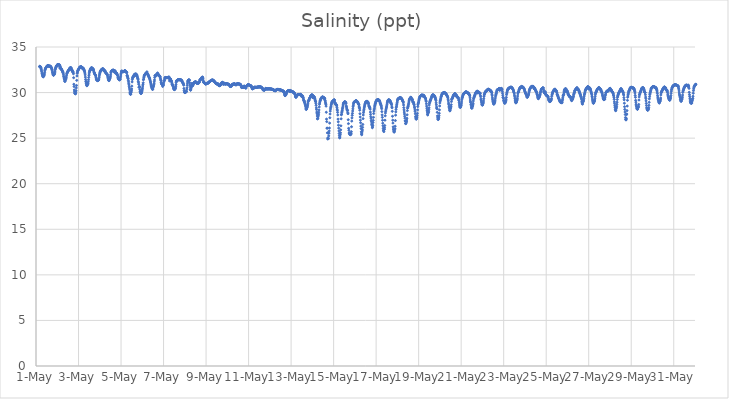
| Category | Salinity (ppt) |
|---|---|
| 44682.166666666664 | 32.84 |
| 44682.177083333336 | 32.89 |
| 44682.1875 | 32.84 |
| 44682.197916666664 | 32.81 |
| 44682.208333333336 | 32.85 |
| 44682.21875 | 32.77 |
| 44682.229166666664 | 32.74 |
| 44682.239583333336 | 32.63 |
| 44682.25 | 32.54 |
| 44682.260416666664 | 32.39 |
| 44682.270833333336 | 32.27 |
| 44682.28125 | 32.12 |
| 44682.291666666664 | 32.03 |
| 44682.302083333336 | 31.93 |
| 44682.3125 | 31.86 |
| 44682.322916666664 | 31.76 |
| 44682.333333333336 | 31.73 |
| 44682.34375 | 31.73 |
| 44682.354166666664 | 31.83 |
| 44682.364583333336 | 31.8 |
| 44682.375 | 31.86 |
| 44682.385416666664 | 31.94 |
| 44682.395833333336 | 32.05 |
| 44682.40625 | 32.22 |
| 44682.416666666664 | 32.4 |
| 44682.427083333336 | 32.54 |
| 44682.4375 | 32.59 |
| 44682.447916666664 | 32.65 |
| 44682.458333333336 | 32.69 |
| 44682.46875 | 32.74 |
| 44682.479166666664 | 32.77 |
| 44682.489583333336 | 32.81 |
| 44682.5 | 32.84 |
| 44682.510416666664 | 32.87 |
| 44682.520833333336 | 32.89 |
| 44682.53125 | 32.94 |
| 44682.541666666664 | 32.95 |
| 44682.552083333336 | 32.95 |
| 44682.5625 | 32.96 |
| 44682.572916666664 | 32.96 |
| 44682.583333333336 | 32.96 |
| 44682.59375 | 32.94 |
| 44682.604166666664 | 32.87 |
| 44682.614583333336 | 32.9 |
| 44682.625 | 32.87 |
| 44682.635416666664 | 32.93 |
| 44682.645833333336 | 32.9 |
| 44682.65625 | 32.85 |
| 44682.666666666664 | 32.88 |
| 44682.677083333336 | 32.89 |
| 44682.6875 | 32.87 |
| 44682.697916666664 | 32.81 |
| 44682.708333333336 | 32.8 |
| 44682.71875 | 32.75 |
| 44682.729166666664 | 32.67 |
| 44682.739583333336 | 32.6 |
| 44682.75 | 32.54 |
| 44682.760416666664 | 32.45 |
| 44682.770833333336 | 32.28 |
| 44682.78125 | 32.18 |
| 44682.791666666664 | 32.06 |
| 44682.802083333336 | 31.96 |
| 44682.8125 | 31.93 |
| 44682.822916666664 | 31.91 |
| 44682.833333333336 | 31.91 |
| 44682.84375 | 31.98 |
| 44682.854166666664 | 32.02 |
| 44682.864583333336 | 32.03 |
| 44682.875 | 32.08 |
| 44682.885416666664 | 32.23 |
| 44682.895833333336 | 32.36 |
| 44682.90625 | 32.54 |
| 44682.916666666664 | 32.63 |
| 44682.927083333336 | 32.72 |
| 44682.9375 | 32.78 |
| 44682.947916666664 | 32.83 |
| 44682.958333333336 | 32.88 |
| 44682.96875 | 32.92 |
| 44682.979166666664 | 32.93 |
| 44682.989583333336 | 32.98 |
| 44683.0 | 33.03 |
| 44683.010416666664 | 33.07 |
| 44683.020833333336 | 33.07 |
| 44683.03125 | 33.07 |
| 44683.041666666664 | 33.07 |
| 44683.052083333336 | 33.06 |
| 44683.0625 | 33.06 |
| 44683.072916666664 | 33 |
| 44683.083333333336 | 33.03 |
| 44683.09375 | 33.04 |
| 44683.104166666664 | 33.05 |
| 44683.114583333336 | 32.7 |
| 44683.125 | 32.89 |
| 44683.135416666664 | 32.91 |
| 44683.145833333336 | 32.79 |
| 44683.15625 | 32.66 |
| 44683.166666666664 | 32.62 |
| 44683.177083333336 | 32.58 |
| 44683.1875 | 32.64 |
| 44683.197916666664 | 32.55 |
| 44683.208333333336 | 32.52 |
| 44683.21875 | 32.46 |
| 44683.229166666664 | 32.43 |
| 44683.239583333336 | 32.37 |
| 44683.25 | 32.27 |
| 44683.260416666664 | 32.27 |
| 44683.270833333336 | 32.23 |
| 44683.28125 | 32.12 |
| 44683.291666666664 | 31.95 |
| 44683.302083333336 | 31.78 |
| 44683.3125 | 31.7 |
| 44683.322916666664 | 31.58 |
| 44683.333333333336 | 31.48 |
| 44683.34375 | 31.39 |
| 44683.354166666664 | 31.24 |
| 44683.364583333336 | 31.22 |
| 44683.375 | 31.36 |
| 44683.385416666664 | 31.42 |
| 44683.395833333336 | 31.44 |
| 44683.40625 | 31.51 |
| 44683.416666666664 | 31.6 |
| 44683.427083333336 | 31.71 |
| 44683.4375 | 31.9 |
| 44683.447916666664 | 32.06 |
| 44683.458333333336 | 32.14 |
| 44683.46875 | 32.16 |
| 44683.479166666664 | 32.23 |
| 44683.489583333336 | 32.3 |
| 44683.5 | 32.34 |
| 44683.510416666664 | 32.36 |
| 44683.520833333336 | 32.4 |
| 44683.53125 | 32.44 |
| 44683.541666666664 | 32.48 |
| 44683.552083333336 | 32.51 |
| 44683.5625 | 32.56 |
| 44683.572916666664 | 32.61 |
| 44683.583333333336 | 32.65 |
| 44683.59375 | 32.68 |
| 44683.604166666664 | 32.7 |
| 44683.614583333336 | 32.71 |
| 44683.625 | 32.75 |
| 44683.635416666664 | 32.7 |
| 44683.645833333336 | 32.72 |
| 44683.65625 | 32.68 |
| 44683.666666666664 | 32.59 |
| 44683.677083333336 | 32.42 |
| 44683.6875 | 32.48 |
| 44683.697916666664 | 32.44 |
| 44683.708333333336 | 32.43 |
| 44683.71875 | 32.3 |
| 44683.729166666664 | 32.26 |
| 44683.739583333336 | 32.28 |
| 44683.75 | 32.23 |
| 44683.760416666664 | 32.06 |
| 44683.770833333336 | 31.63 |
| 44683.78125 | 30.91 |
| 44683.791666666664 | 30.66 |
| 44683.802083333336 | 30.29 |
| 44683.8125 | 30.1 |
| 44683.822916666664 | 29.96 |
| 44683.833333333336 | 29.9 |
| 44683.84375 | 29.87 |
| 44683.854166666664 | 29.88 |
| 44683.864583333336 | 29.88 |
| 44683.875 | 30.06 |
| 44683.885416666664 | 30.21 |
| 44683.895833333336 | 30.51 |
| 44683.90625 | 30.78 |
| 44683.916666666664 | 31.34 |
| 44683.927083333336 | 31.82 |
| 44683.9375 | 32.11 |
| 44683.947916666664 | 32.22 |
| 44683.958333333336 | 32.34 |
| 44683.96875 | 32.42 |
| 44683.979166666664 | 32.44 |
| 44683.989583333336 | 32.5 |
| 44684.0 | 32.55 |
| 44684.010416666664 | 32.58 |
| 44684.020833333336 | 32.62 |
| 44684.03125 | 32.68 |
| 44684.041666666664 | 32.73 |
| 44684.052083333336 | 32.77 |
| 44684.0625 | 32.79 |
| 44684.072916666664 | 32.8 |
| 44684.083333333336 | 32.81 |
| 44684.09375 | 32.81 |
| 44684.104166666664 | 32.81 |
| 44684.114583333336 | 32.82 |
| 44684.125 | 32.83 |
| 44684.135416666664 | 32.83 |
| 44684.145833333336 | 32.8 |
| 44684.15625 | 32.69 |
| 44684.166666666664 | 32.71 |
| 44684.177083333336 | 32.69 |
| 44684.1875 | 32.67 |
| 44684.197916666664 | 32.67 |
| 44684.208333333336 | 32.72 |
| 44684.21875 | 32.66 |
| 44684.229166666664 | 32.63 |
| 44684.239583333336 | 32.61 |
| 44684.25 | 32.51 |
| 44684.260416666664 | 32.47 |
| 44684.270833333336 | 32.44 |
| 44684.28125 | 32.35 |
| 44684.291666666664 | 32.25 |
| 44684.302083333336 | 32.13 |
| 44684.3125 | 31.94 |
| 44684.322916666664 | 31.7 |
| 44684.333333333336 | 31.45 |
| 44684.34375 | 31.25 |
| 44684.354166666664 | 31.16 |
| 44684.364583333336 | 31 |
| 44684.375 | 30.88 |
| 44684.385416666664 | 30.79 |
| 44684.395833333336 | 30.74 |
| 44684.40625 | 30.8 |
| 44684.416666666664 | 30.91 |
| 44684.427083333336 | 30.9 |
| 44684.4375 | 30.93 |
| 44684.447916666664 | 31.02 |
| 44684.458333333336 | 31.18 |
| 44684.46875 | 31.4 |
| 44684.479166666664 | 31.65 |
| 44684.489583333336 | 31.87 |
| 44684.5 | 32.04 |
| 44684.510416666664 | 32.21 |
| 44684.520833333336 | 32.32 |
| 44684.53125 | 32.39 |
| 44684.541666666664 | 32.45 |
| 44684.552083333336 | 32.5 |
| 44684.5625 | 32.57 |
| 44684.572916666664 | 32.62 |
| 44684.583333333336 | 32.66 |
| 44684.59375 | 32.69 |
| 44684.604166666664 | 32.71 |
| 44684.614583333336 | 32.74 |
| 44684.625 | 32.6 |
| 44684.635416666664 | 32.53 |
| 44684.645833333336 | 32.69 |
| 44684.65625 | 32.65 |
| 44684.666666666664 | 32.61 |
| 44684.677083333336 | 32.58 |
| 44684.6875 | 32.6 |
| 44684.697916666664 | 32.53 |
| 44684.708333333336 | 32.48 |
| 44684.71875 | 32.35 |
| 44684.729166666664 | 32.23 |
| 44684.739583333336 | 32.15 |
| 44684.75 | 32.16 |
| 44684.760416666664 | 32.05 |
| 44684.770833333336 | 32 |
| 44684.78125 | 31.96 |
| 44684.791666666664 | 31.92 |
| 44684.802083333336 | 31.89 |
| 44684.8125 | 31.81 |
| 44684.822916666664 | 31.65 |
| 44684.833333333336 | 31.5 |
| 44684.84375 | 31.44 |
| 44684.854166666664 | 31.4 |
| 44684.864583333336 | 31.38 |
| 44684.875 | 31.36 |
| 44684.885416666664 | 31.33 |
| 44684.895833333336 | 31.31 |
| 44684.90625 | 31.32 |
| 44684.916666666664 | 31.39 |
| 44684.927083333336 | 31.37 |
| 44684.9375 | 31.36 |
| 44684.947916666664 | 31.39 |
| 44684.958333333336 | 31.49 |
| 44684.96875 | 31.65 |
| 44684.979166666664 | 31.83 |
| 44684.989583333336 | 31.99 |
| 44685.0 | 32.12 |
| 44685.010416666664 | 32.21 |
| 44685.020833333336 | 32.28 |
| 44685.03125 | 32.34 |
| 44685.041666666664 | 32.39 |
| 44685.052083333336 | 32.43 |
| 44685.0625 | 32.46 |
| 44685.072916666664 | 32.5 |
| 44685.083333333336 | 32.52 |
| 44685.09375 | 32.53 |
| 44685.104166666664 | 32.56 |
| 44685.114583333336 | 32.59 |
| 44685.125 | 32.6 |
| 44685.135416666664 | 32.62 |
| 44685.145833333336 | 32.59 |
| 44685.15625 | 32.59 |
| 44685.166666666664 | 32.58 |
| 44685.177083333336 | 32.42 |
| 44685.1875 | 32.49 |
| 44685.197916666664 | 32.46 |
| 44685.208333333336 | 32.46 |
| 44685.21875 | 32.36 |
| 44685.229166666664 | 32.39 |
| 44685.239583333336 | 32.4 |
| 44685.25 | 32.36 |
| 44685.260416666664 | 32.22 |
| 44685.270833333336 | 32.25 |
| 44685.28125 | 32.17 |
| 44685.291666666664 | 32.15 |
| 44685.302083333336 | 32.12 |
| 44685.3125 | 32.09 |
| 44685.322916666664 | 32.06 |
| 44685.333333333336 | 32.04 |
| 44685.34375 | 32.02 |
| 44685.354166666664 | 31.98 |
| 44685.364583333336 | 31.89 |
| 44685.375 | 31.74 |
| 44685.385416666664 | 31.63 |
| 44685.395833333336 | 31.53 |
| 44685.40625 | 31.43 |
| 44685.416666666664 | 31.37 |
| 44685.427083333336 | 31.31 |
| 44685.4375 | 31.31 |
| 44685.447916666664 | 31.43 |
| 44685.458333333336 | 31.46 |
| 44685.46875 | 31.5 |
| 44685.479166666664 | 31.56 |
| 44685.489583333336 | 31.66 |
| 44685.5 | 31.78 |
| 44685.510416666664 | 31.95 |
| 44685.520833333336 | 32.17 |
| 44685.53125 | 32.27 |
| 44685.541666666664 | 32.31 |
| 44685.552083333336 | 32.33 |
| 44685.5625 | 32.37 |
| 44685.572916666664 | 32.42 |
| 44685.583333333336 | 32.42 |
| 44685.59375 | 32.44 |
| 44685.604166666664 | 32.44 |
| 44685.614583333336 | 32.44 |
| 44685.625 | 32.46 |
| 44685.635416666664 | 32.45 |
| 44685.645833333336 | 32.46 |
| 44685.65625 | 32.42 |
| 44685.666666666664 | 32.32 |
| 44685.677083333336 | 32.26 |
| 44685.6875 | 32.29 |
| 44685.697916666664 | 32.41 |
| 44685.708333333336 | 32.37 |
| 44685.71875 | 32.35 |
| 44685.729166666664 | 32.35 |
| 44685.739583333336 | 32.13 |
| 44685.75 | 32.2 |
| 44685.760416666664 | 32.14 |
| 44685.770833333336 | 32.14 |
| 44685.78125 | 32.16 |
| 44685.791666666664 | 32.09 |
| 44685.802083333336 | 32.11 |
| 44685.8125 | 32.01 |
| 44685.822916666664 | 31.95 |
| 44685.833333333336 | 31.88 |
| 44685.84375 | 31.85 |
| 44685.854166666664 | 31.61 |
| 44685.864583333336 | 31.68 |
| 44685.875 | 31.52 |
| 44685.885416666664 | 31.53 |
| 44685.895833333336 | 31.45 |
| 44685.90625 | 31.46 |
| 44685.916666666664 | 31.43 |
| 44685.927083333336 | 31.37 |
| 44685.9375 | 31.45 |
| 44685.947916666664 | 31.42 |
| 44685.958333333336 | 31.47 |
| 44685.96875 | 31.6 |
| 44685.979166666664 | 31.75 |
| 44685.989583333336 | 31.93 |
| 44686.0 | 32.09 |
| 44686.010416666664 | 32.25 |
| 44686.020833333336 | 32.33 |
| 44686.03125 | 32.35 |
| 44686.041666666664 | 32.35 |
| 44686.052083333336 | 32.35 |
| 44686.0625 | 32.3 |
| 44686.072916666664 | 32.3 |
| 44686.083333333336 | 32.29 |
| 44686.09375 | 32.28 |
| 44686.104166666664 | 32.29 |
| 44686.114583333336 | 32.31 |
| 44686.125 | 32.31 |
| 44686.135416666664 | 32.31 |
| 44686.145833333336 | 32.33 |
| 44686.15625 | 32.37 |
| 44686.166666666664 | 32.39 |
| 44686.177083333336 | 32.4 |
| 44686.1875 | 32.39 |
| 44686.197916666664 | 32.37 |
| 44686.208333333336 | 32.37 |
| 44686.21875 | 32.26 |
| 44686.229166666664 | 32.3 |
| 44686.239583333336 | 32.29 |
| 44686.25 | 32.27 |
| 44686.260416666664 | 32.21 |
| 44686.270833333336 | 32.17 |
| 44686.28125 | 31.84 |
| 44686.291666666664 | 31.9 |
| 44686.302083333336 | 31.78 |
| 44686.3125 | 31.68 |
| 44686.322916666664 | 31.58 |
| 44686.333333333336 | 31.52 |
| 44686.34375 | 31.34 |
| 44686.354166666664 | 31.17 |
| 44686.364583333336 | 30.97 |
| 44686.375 | 30.84 |
| 44686.385416666664 | 30.65 |
| 44686.395833333336 | 30.5 |
| 44686.40625 | 30.3 |
| 44686.416666666664 | 30.05 |
| 44686.427083333336 | 29.92 |
| 44686.4375 | 29.82 |
| 44686.447916666664 | 29.82 |
| 44686.458333333336 | 29.82 |
| 44686.46875 | 29.99 |
| 44686.479166666664 | 30.08 |
| 44686.489583333336 | 30.22 |
| 44686.5 | 30.4 |
| 44686.510416666664 | 30.71 |
| 44686.520833333336 | 31.17 |
| 44686.53125 | 31.43 |
| 44686.541666666664 | 31.58 |
| 44686.552083333336 | 31.68 |
| 44686.5625 | 31.71 |
| 44686.572916666664 | 31.7 |
| 44686.583333333336 | 31.75 |
| 44686.59375 | 31.81 |
| 44686.604166666664 | 31.87 |
| 44686.614583333336 | 31.93 |
| 44686.625 | 31.93 |
| 44686.635416666664 | 32 |
| 44686.645833333336 | 32 |
| 44686.65625 | 32 |
| 44686.666666666664 | 31.89 |
| 44686.677083333336 | 31.89 |
| 44686.6875 | 32.07 |
| 44686.697916666664 | 31.98 |
| 44686.708333333336 | 31.94 |
| 44686.71875 | 32.01 |
| 44686.739583333336 | 31.95 |
| 44686.75 | 31.87 |
| 44686.760416666664 | 31.79 |
| 44686.770833333336 | 31.69 |
| 44686.78125 | 31.58 |
| 44686.791666666664 | 31.52 |
| 44686.802083333336 | 31.44 |
| 44686.8125 | 31.23 |
| 44686.822916666664 | 31.09 |
| 44686.833333333336 | 30.91 |
| 44686.84375 | 30.59 |
| 44686.854166666664 | 30.58 |
| 44686.864583333336 | 30.68 |
| 44686.875 | 30.62 |
| 44686.885416666664 | 30.34 |
| 44686.895833333336 | 30.14 |
| 44686.90625 | 30.05 |
| 44686.916666666664 | 30.03 |
| 44686.927083333336 | 29.92 |
| 44686.9375 | 29.88 |
| 44686.947916666664 | 29.93 |
| 44686.958333333336 | 29.95 |
| 44686.96875 | 30.04 |
| 44686.979166666664 | 30.11 |
| 44686.989583333336 | 30.22 |
| 44687.0 | 30.37 |
| 44687.010416666664 | 30.5 |
| 44687.020833333336 | 30.72 |
| 44687.03125 | 30.9 |
| 44687.041666666664 | 31.07 |
| 44687.052083333336 | 31.4 |
| 44687.0625 | 31.48 |
| 44687.072916666664 | 31.64 |
| 44687.083333333336 | 31.75 |
| 44687.09375 | 31.86 |
| 44687.104166666664 | 31.92 |
| 44687.114583333336 | 31.94 |
| 44687.125 | 31.98 |
| 44687.135416666664 | 32.01 |
| 44687.145833333336 | 32.06 |
| 44687.15625 | 32.09 |
| 44687.166666666664 | 32.11 |
| 44687.177083333336 | 32.12 |
| 44687.1875 | 32.15 |
| 44687.197916666664 | 32.16 |
| 44687.208333333336 | 32.17 |
| 44687.21875 | 32.28 |
| 44687.229166666664 | 32.09 |
| 44687.239583333336 | 32.07 |
| 44687.25 | 32.08 |
| 44687.260416666664 | 32 |
| 44687.270833333336 | 31.89 |
| 44687.28125 | 31.93 |
| 44687.291666666664 | 31.83 |
| 44687.302083333336 | 31.8 |
| 44687.3125 | 31.72 |
| 44687.322916666664 | 31.65 |
| 44687.333333333336 | 31.63 |
| 44687.34375 | 31.54 |
| 44687.354166666664 | 31.47 |
| 44687.364583333336 | 31.37 |
| 44687.375 | 31.27 |
| 44687.385416666664 | 31.16 |
| 44687.395833333336 | 31.05 |
| 44687.40625 | 30.92 |
| 44687.416666666664 | 30.81 |
| 44687.427083333336 | 30.69 |
| 44687.4375 | 30.63 |
| 44687.447916666664 | 30.52 |
| 44687.458333333336 | 30.5 |
| 44687.46875 | 30.45 |
| 44687.479166666664 | 30.34 |
| 44687.489583333336 | 30.38 |
| 44687.5 | 30.39 |
| 44687.510416666664 | 30.57 |
| 44687.520833333336 | 30.69 |
| 44687.53125 | 30.74 |
| 44687.541666666664 | 30.86 |
| 44687.552083333336 | 30.98 |
| 44687.5625 | 31.18 |
| 44687.572916666664 | 31.38 |
| 44687.583333333336 | 31.65 |
| 44687.59375 | 31.83 |
| 44687.604166666664 | 31.88 |
| 44687.614583333336 | 31.86 |
| 44687.625 | 31.83 |
| 44687.635416666664 | 31.88 |
| 44687.645833333336 | 31.92 |
| 44687.65625 | 31.95 |
| 44687.666666666664 | 31.98 |
| 44687.677083333336 | 31.99 |
| 44687.6875 | 31.98 |
| 44687.697916666664 | 32 |
| 44687.708333333336 | 32.09 |
| 44687.71875 | 32.16 |
| 44687.729166666664 | 31.92 |
| 44687.739583333336 | 32.02 |
| 44687.75 | 31.95 |
| 44687.760416666664 | 32 |
| 44687.770833333336 | 31.91 |
| 44687.78125 | 31.91 |
| 44687.791666666664 | 31.87 |
| 44687.802083333336 | 31.83 |
| 44687.8125 | 31.81 |
| 44687.822916666664 | 31.78 |
| 44687.833333333336 | 31.77 |
| 44687.84375 | 31.68 |
| 44687.854166666664 | 31.53 |
| 44687.864583333336 | 31.38 |
| 44687.875 | 31.37 |
| 44687.885416666664 | 31.14 |
| 44687.895833333336 | 31.07 |
| 44687.90625 | 30.97 |
| 44687.916666666664 | 30.93 |
| 44687.927083333336 | 30.91 |
| 44687.9375 | 30.88 |
| 44687.947916666664 | 30.86 |
| 44687.958333333336 | 30.67 |
| 44687.96875 | 30.81 |
| 44687.979166666664 | 30.82 |
| 44687.989583333336 | 30.81 |
| 44688.0 | 30.95 |
| 44688.010416666664 | 31.15 |
| 44688.020833333336 | 31.3 |
| 44688.03125 | 31.28 |
| 44688.041666666664 | 31.33 |
| 44688.052083333336 | 31.49 |
| 44688.0625 | 31.59 |
| 44688.072916666664 | 31.64 |
| 44688.083333333336 | 31.66 |
| 44688.09375 | 31.65 |
| 44688.104166666664 | 31.65 |
| 44688.114583333336 | 31.64 |
| 44688.125 | 31.64 |
| 44688.135416666664 | 31.64 |
| 44688.145833333336 | 31.64 |
| 44688.15625 | 31.63 |
| 44688.166666666664 | 31.63 |
| 44688.177083333336 | 31.64 |
| 44688.1875 | 31.65 |
| 44688.197916666664 | 31.66 |
| 44688.208333333336 | 31.67 |
| 44688.21875 | 31.66 |
| 44688.229166666664 | 31.66 |
| 44688.239583333336 | 31.68 |
| 44688.25 | 31.69 |
| 44688.260416666664 | 31.71 |
| 44688.270833333336 | 31.53 |
| 44688.28125 | 31.28 |
| 44688.291666666664 | 31.52 |
| 44688.302083333336 | 31.49 |
| 44688.3125 | 31.46 |
| 44688.322916666664 | 31.52 |
| 44688.333333333336 | 31.46 |
| 44688.34375 | 31.37 |
| 44688.354166666664 | 31.32 |
| 44688.364583333336 | 31.26 |
| 44688.375 | 31.26 |
| 44688.385416666664 | 31.13 |
| 44688.395833333336 | 30.96 |
| 44688.40625 | 30.91 |
| 44688.416666666664 | 30.88 |
| 44688.427083333336 | 30.82 |
| 44688.4375 | 30.75 |
| 44688.447916666664 | 30.7 |
| 44688.458333333336 | 30.62 |
| 44688.46875 | 30.49 |
| 44688.479166666664 | 30.41 |
| 44688.489583333336 | 30.4 |
| 44688.5 | 30.34 |
| 44688.510416666664 | 30.33 |
| 44688.520833333336 | 30.33 |
| 44688.53125 | 30.4 |
| 44688.541666666664 | 30.4 |
| 44688.552083333336 | 30.43 |
| 44688.5625 | 30.52 |
| 44688.572916666664 | 30.69 |
| 44688.583333333336 | 30.87 |
| 44688.59375 | 31.1 |
| 44688.604166666664 | 31.23 |
| 44688.614583333336 | 31.29 |
| 44688.625 | 31.31 |
| 44688.635416666664 | 31.34 |
| 44688.645833333336 | 31.34 |
| 44688.65625 | 31.36 |
| 44688.666666666664 | 31.39 |
| 44688.677083333336 | 31.41 |
| 44688.6875 | 31.41 |
| 44688.697916666664 | 31.41 |
| 44688.708333333336 | 31.4 |
| 44688.71875 | 31.41 |
| 44688.729166666664 | 31.42 |
| 44688.739583333336 | 31.42 |
| 44688.75 | 31.42 |
| 44688.760416666664 | 31.4 |
| 44688.770833333336 | 31.39 |
| 44688.78125 | 31.4 |
| 44688.791666666664 | 31.41 |
| 44688.802083333336 | 31.42 |
| 44688.8125 | 31.41 |
| 44688.822916666664 | 31.36 |
| 44688.833333333336 | 31.36 |
| 44688.84375 | 31.34 |
| 44688.854166666664 | 31.33 |
| 44688.864583333336 | 31.27 |
| 44688.875 | 31.25 |
| 44688.885416666664 | 31.13 |
| 44688.895833333336 | 31.1 |
| 44688.90625 | 31.07 |
| 44688.916666666664 | 31.05 |
| 44688.927083333336 | 30.96 |
| 44688.9375 | 30.92 |
| 44688.947916666664 | 30.81 |
| 44688.958333333336 | 30.45 |
| 44688.96875 | 30.22 |
| 44688.979166666664 | 30.07 |
| 44688.989583333336 | 30.02 |
| 44689.0 | 30 |
| 44689.010416666664 | 30.01 |
| 44689.020833333336 | 30.01 |
| 44689.03125 | 30.05 |
| 44689.041666666664 | 30.06 |
| 44689.052083333336 | 30.07 |
| 44689.0625 | 30.09 |
| 44689.072916666664 | 30.11 |
| 44689.083333333336 | 30.14 |
| 44689.09375 | 30.36 |
| 44689.104166666664 | 30.53 |
| 44689.114583333336 | 30.8 |
| 44689.125 | 31.03 |
| 44689.135416666664 | 31.19 |
| 44689.145833333336 | 31.28 |
| 44689.15625 | 31.33 |
| 44689.166666666664 | 31.36 |
| 44689.177083333336 | 31.38 |
| 44689.1875 | 31.38 |
| 44689.197916666664 | 31.38 |
| 44689.208333333336 | 31.39 |
| 44689.21875 | 31.35 |
| 44689.229166666664 | 31.09 |
| 44689.239583333336 | 30.86 |
| 44689.25 | 30.66 |
| 44689.260416666664 | 30.37 |
| 44689.270833333336 | 30.25 |
| 44689.28125 | 30.31 |
| 44689.291666666664 | 30.49 |
| 44689.302083333336 | 30.54 |
| 44689.3125 | 30.68 |
| 44689.322916666664 | 30.78 |
| 44689.333333333336 | 31.01 |
| 44689.34375 | 30.82 |
| 44689.354166666664 | 30.84 |
| 44689.364583333336 | 30.75 |
| 44689.375 | 30.76 |
| 44689.385416666664 | 30.91 |
| 44689.395833333336 | 30.87 |
| 44689.40625 | 30.99 |
| 44689.416666666664 | 31.04 |
| 44689.427083333336 | 31.07 |
| 44689.4375 | 31.1 |
| 44689.447916666664 | 31.12 |
| 44689.458333333336 | 31.09 |
| 44689.46875 | 31.13 |
| 44689.479166666664 | 31.17 |
| 44689.489583333336 | 31.16 |
| 44689.5 | 31.2 |
| 44689.510416666664 | 31.21 |
| 44689.520833333336 | 31.14 |
| 44689.53125 | 31.12 |
| 44689.541666666664 | 31.07 |
| 44689.552083333336 | 31.07 |
| 44689.5625 | 31.03 |
| 44689.572916666664 | 31.03 |
| 44689.583333333336 | 31.04 |
| 44689.59375 | 31.03 |
| 44689.604166666664 | 31.05 |
| 44689.614583333336 | 31.04 |
| 44689.625 | 31.04 |
| 44689.635416666664 | 31.03 |
| 44689.645833333336 | 31.03 |
| 44689.65625 | 31.05 |
| 44689.666666666664 | 31.11 |
| 44689.677083333336 | 31.15 |
| 44689.6875 | 31.16 |
| 44689.697916666664 | 31.29 |
| 44689.708333333336 | 31.38 |
| 44689.71875 | 31.44 |
| 44689.729166666664 | 31.43 |
| 44689.739583333336 | 31.42 |
| 44689.75 | 31.44 |
| 44689.760416666664 | 31.46 |
| 44689.770833333336 | 31.52 |
| 44689.78125 | 31.59 |
| 44689.791666666664 | 31.62 |
| 44689.802083333336 | 31.65 |
| 44689.8125 | 31.68 |
| 44689.822916666664 | 31.66 |
| 44689.833333333336 | 31.71 |
| 44689.84375 | 31.66 |
| 44689.854166666664 | 31.54 |
| 44689.864583333336 | 31.36 |
| 44689.875 | 31.21 |
| 44689.885416666664 | 31.13 |
| 44689.895833333336 | 31.1 |
| 44689.90625 | 31.09 |
| 44689.916666666664 | 31.1 |
| 44689.927083333336 | 31.07 |
| 44689.9375 | 31.06 |
| 44689.947916666664 | 31 |
| 44689.958333333336 | 30.98 |
| 44689.96875 | 30.96 |
| 44689.979166666664 | 30.93 |
| 44689.989583333336 | 30.93 |
| 44690.0 | 30.97 |
| 44690.010416666664 | 30.97 |
| 44690.020833333336 | 31 |
| 44690.03125 | 30.99 |
| 44690.041666666664 | 31 |
| 44690.052083333336 | 31.02 |
| 44690.0625 | 31.03 |
| 44690.072916666664 | 31.03 |
| 44690.083333333336 | 31.04 |
| 44690.09375 | 31.04 |
| 44690.104166666664 | 31.05 |
| 44690.114583333336 | 31.07 |
| 44690.125 | 31.12 |
| 44690.135416666664 | 31.14 |
| 44690.145833333336 | 31.16 |
| 44690.15625 | 31.19 |
| 44690.166666666664 | 31.22 |
| 44690.177083333336 | 31.22 |
| 44690.1875 | 31.23 |
| 44690.197916666664 | 31.27 |
| 44690.208333333336 | 31.29 |
| 44690.21875 | 31.3 |
| 44690.229166666664 | 31.3 |
| 44690.239583333336 | 31.32 |
| 44690.25 | 31.34 |
| 44690.260416666664 | 31.35 |
| 44690.270833333336 | 31.36 |
| 44690.28125 | 31.37 |
| 44690.291666666664 | 31.37 |
| 44690.302083333336 | 31.37 |
| 44690.3125 | 31.37 |
| 44690.322916666664 | 31.37 |
| 44690.333333333336 | 31.28 |
| 44690.34375 | 31.35 |
| 44690.354166666664 | 31.32 |
| 44690.364583333336 | 31.3 |
| 44690.375 | 31.25 |
| 44690.385416666664 | 31.23 |
| 44690.395833333336 | 31.18 |
| 44690.40625 | 31.17 |
| 44690.416666666664 | 31.17 |
| 44690.427083333336 | 31.14 |
| 44690.4375 | 31.1 |
| 44690.447916666664 | 31.05 |
| 44690.458333333336 | 31.01 |
| 44690.46875 | 30.98 |
| 44690.479166666664 | 30.96 |
| 44690.489583333336 | 30.97 |
| 44690.5 | 30.95 |
| 44690.510416666664 | 30.97 |
| 44690.520833333336 | 30.96 |
| 44690.53125 | 30.94 |
| 44690.541666666664 | 30.95 |
| 44690.552083333336 | 30.95 |
| 44690.5625 | 30.94 |
| 44690.572916666664 | 30.94 |
| 44690.583333333336 | 30.9 |
| 44690.59375 | 30.79 |
| 44690.604166666664 | 30.76 |
| 44690.614583333336 | 30.76 |
| 44690.625 | 30.76 |
| 44690.635416666664 | 30.76 |
| 44690.645833333336 | 30.78 |
| 44690.65625 | 30.8 |
| 44690.666666666664 | 30.8 |
| 44690.677083333336 | 30.8 |
| 44690.6875 | 30.86 |
| 44690.697916666664 | 30.96 |
| 44690.708333333336 | 31.03 |
| 44690.71875 | 31.04 |
| 44690.729166666664 | 31.05 |
| 44690.739583333336 | 31.05 |
| 44690.75 | 31.06 |
| 44690.760416666664 | 31.1 |
| 44690.770833333336 | 31.11 |
| 44690.78125 | 31.13 |
| 44690.791666666664 | 30.96 |
| 44690.802083333336 | 31.05 |
| 44690.8125 | 30.91 |
| 44690.822916666664 | 30.93 |
| 44690.833333333336 | 30.97 |
| 44690.84375 | 30.96 |
| 44690.854166666664 | 30.96 |
| 44690.864583333336 | 31.03 |
| 44690.875 | 30.98 |
| 44690.885416666664 | 30.96 |
| 44690.895833333336 | 30.94 |
| 44690.90625 | 30.92 |
| 44690.916666666664 | 30.93 |
| 44690.927083333336 | 30.95 |
| 44690.9375 | 30.96 |
| 44690.947916666664 | 30.98 |
| 44690.958333333336 | 30.96 |
| 44690.96875 | 30.97 |
| 44690.979166666664 | 30.97 |
| 44690.989583333336 | 30.96 |
| 44691.0 | 30.94 |
| 44691.010416666664 | 30.94 |
| 44691.020833333336 | 30.92 |
| 44691.03125 | 30.93 |
| 44691.041666666664 | 30.92 |
| 44691.052083333336 | 30.93 |
| 44691.0625 | 30.89 |
| 44691.072916666664 | 30.86 |
| 44691.083333333336 | 30.89 |
| 44691.09375 | 30.83 |
| 44691.104166666664 | 30.76 |
| 44691.114583333336 | 30.81 |
| 44691.125 | 30.72 |
| 44691.135416666664 | 30.65 |
| 44691.145833333336 | 30.67 |
| 44691.15625 | 30.68 |
| 44691.166666666664 | 30.7 |
| 44691.177083333336 | 30.69 |
| 44691.1875 | 30.7 |
| 44691.197916666664 | 30.71 |
| 44691.208333333336 | 30.82 |
| 44691.21875 | 30.89 |
| 44691.229166666664 | 30.87 |
| 44691.239583333336 | 30.89 |
| 44691.25 | 30.9 |
| 44691.260416666664 | 30.93 |
| 44691.270833333336 | 30.93 |
| 44691.28125 | 30.92 |
| 44691.291666666664 | 30.92 |
| 44691.302083333336 | 30.93 |
| 44691.3125 | 30.95 |
| 44691.322916666664 | 30.96 |
| 44691.333333333336 | 30.97 |
| 44691.34375 | 30.91 |
| 44691.354166666664 | 30.96 |
| 44691.364583333336 | 30.93 |
| 44691.375 | 30.87 |
| 44691.385416666664 | 30.9 |
| 44691.395833333336 | 30.86 |
| 44691.40625 | 30.84 |
| 44691.416666666664 | 30.86 |
| 44691.427083333336 | 30.87 |
| 44691.4375 | 30.92 |
| 44691.447916666664 | 30.94 |
| 44691.458333333336 | 30.94 |
| 44691.46875 | 30.99 |
| 44691.479166666664 | 30.96 |
| 44691.489583333336 | 30.96 |
| 44691.5 | 30.96 |
| 44691.510416666664 | 30.95 |
| 44691.520833333336 | 30.96 |
| 44691.53125 | 30.95 |
| 44691.541666666664 | 30.94 |
| 44691.552083333336 | 30.93 |
| 44691.5625 | 30.93 |
| 44691.572916666664 | 30.94 |
| 44691.583333333336 | 30.92 |
| 44691.59375 | 30.89 |
| 44691.604166666664 | 30.91 |
| 44691.614583333336 | 30.88 |
| 44691.625 | 30.9 |
| 44691.635416666664 | 30.76 |
| 44691.645833333336 | 30.79 |
| 44691.65625 | 30.62 |
| 44691.666666666664 | 30.57 |
| 44691.677083333336 | 30.55 |
| 44691.6875 | 30.56 |
| 44691.697916666664 | 30.58 |
| 44691.708333333336 | 30.64 |
| 44691.71875 | 30.6 |
| 44691.729166666664 | 30.57 |
| 44691.739583333336 | 30.56 |
| 44691.75 | 30.57 |
| 44691.760416666664 | 30.59 |
| 44691.770833333336 | 30.64 |
| 44691.78125 | 30.7 |
| 44691.791666666664 | 30.71 |
| 44691.802083333336 | 30.7 |
| 44691.8125 | 30.61 |
| 44691.822916666664 | 30.6 |
| 44691.833333333336 | 30.6 |
| 44691.84375 | 30.58 |
| 44691.854166666664 | 30.52 |
| 44691.864583333336 | 30.5 |
| 44691.875 | 30.51 |
| 44691.885416666664 | 30.51 |
| 44691.895833333336 | 30.69 |
| 44691.90625 | 30.73 |
| 44691.916666666664 | 30.75 |
| 44691.927083333336 | 30.77 |
| 44691.9375 | 30.79 |
| 44691.947916666664 | 30.81 |
| 44691.958333333336 | 30.84 |
| 44691.96875 | 30.87 |
| 44691.979166666664 | 30.86 |
| 44691.989583333336 | 30.84 |
| 44692.0 | 30.83 |
| 44692.010416666664 | 30.84 |
| 44692.020833333336 | 30.84 |
| 44692.03125 | 30.83 |
| 44692.041666666664 | 30.81 |
| 44692.052083333336 | 30.8 |
| 44692.0625 | 30.78 |
| 44692.072916666664 | 30.78 |
| 44692.083333333336 | 30.76 |
| 44692.09375 | 30.74 |
| 44692.104166666664 | 30.76 |
| 44692.114583333336 | 30.69 |
| 44692.125 | 30.74 |
| 44692.135416666664 | 30.65 |
| 44692.145833333336 | 30.57 |
| 44692.15625 | 30.53 |
| 44692.166666666664 | 30.42 |
| 44692.177083333336 | 30.4 |
| 44692.1875 | 30.43 |
| 44692.197916666664 | 30.47 |
| 44692.208333333336 | 30.45 |
| 44692.21875 | 30.45 |
| 44692.229166666664 | 30.45 |
| 44692.239583333336 | 30.47 |
| 44692.25 | 30.52 |
| 44692.260416666664 | 30.59 |
| 44692.270833333336 | 30.58 |
| 44692.28125 | 30.57 |
| 44692.291666666664 | 30.58 |
| 44692.302083333336 | 30.58 |
| 44692.3125 | 30.58 |
| 44692.322916666664 | 30.58 |
| 44692.333333333336 | 30.58 |
| 44692.34375 | 30.57 |
| 44692.354166666664 | 30.57 |
| 44692.364583333336 | 30.57 |
| 44692.375 | 30.57 |
| 44692.385416666664 | 30.59 |
| 44692.395833333336 | 30.58 |
| 44692.40625 | 30.57 |
| 44692.416666666664 | 30.59 |
| 44692.427083333336 | 30.6 |
| 44692.4375 | 30.62 |
| 44692.447916666664 | 30.63 |
| 44692.458333333336 | 30.6 |
| 44692.46875 | 30.61 |
| 44692.479166666664 | 30.62 |
| 44692.489583333336 | 30.63 |
| 44692.5 | 30.62 |
| 44692.510416666664 | 30.63 |
| 44692.520833333336 | 30.62 |
| 44692.53125 | 30.62 |
| 44692.541666666664 | 30.62 |
| 44692.552083333336 | 30.64 |
| 44692.5625 | 30.62 |
| 44692.572916666664 | 30.61 |
| 44692.583333333336 | 30.61 |
| 44692.59375 | 30.59 |
| 44692.604166666664 | 30.58 |
| 44692.614583333336 | 30.54 |
| 44692.625 | 30.52 |
| 44692.635416666664 | 30.5 |
| 44692.645833333336 | 30.46 |
| 44692.65625 | 30.47 |
| 44692.666666666664 | 30.4 |
| 44692.677083333336 | 30.32 |
| 44692.6875 | 30.27 |
| 44692.697916666664 | 30.28 |
| 44692.708333333336 | 30.33 |
| 44692.71875 | 30.34 |
| 44692.729166666664 | 30.28 |
| 44692.739583333336 | 30.25 |
| 44692.75 | 30.27 |
| 44692.760416666664 | 30.31 |
| 44692.770833333336 | 30.34 |
| 44692.78125 | 30.38 |
| 44692.791666666664 | 30.42 |
| 44692.802083333336 | 30.46 |
| 44692.8125 | 30.46 |
| 44692.822916666664 | 30.43 |
| 44692.833333333336 | 30.4 |
| 44692.84375 | 30.39 |
| 44692.854166666664 | 30.4 |
| 44692.864583333336 | 30.4 |
| 44692.875 | 30.4 |
| 44692.885416666664 | 30.41 |
| 44692.895833333336 | 30.41 |
| 44692.90625 | 30.4 |
| 44692.916666666664 | 30.4 |
| 44692.927083333336 | 30.4 |
| 44692.9375 | 30.41 |
| 44692.947916666664 | 30.41 |
| 44692.958333333336 | 30.42 |
| 44692.96875 | 30.42 |
| 44692.979166666664 | 30.4 |
| 44692.989583333336 | 30.4 |
| 44693.0 | 30.41 |
| 44693.010416666664 | 30.4 |
| 44693.020833333336 | 30.4 |
| 44693.03125 | 30.4 |
| 44693.041666666664 | 30.4 |
| 44693.052083333336 | 30.4 |
| 44693.0625 | 30.38 |
| 44693.072916666664 | 30.38 |
| 44693.083333333336 | 30.38 |
| 44693.09375 | 30.37 |
| 44693.104166666664 | 30.35 |
| 44693.114583333336 | 30.36 |
| 44693.125 | 30.35 |
| 44693.135416666664 | 30.33 |
| 44693.145833333336 | 30.32 |
| 44693.15625 | 30.33 |
| 44693.166666666664 | 30.29 |
| 44693.177083333336 | 30.27 |
| 44693.1875 | 30.27 |
| 44693.197916666664 | 30.28 |
| 44693.208333333336 | 30.2 |
| 44693.21875 | 30.23 |
| 44693.229166666664 | 30.24 |
| 44693.239583333336 | 30.21 |
| 44693.25 | 30.2 |
| 44693.260416666664 | 30.2 |
| 44693.270833333336 | 30.22 |
| 44693.28125 | 30.24 |
| 44693.291666666664 | 30.28 |
| 44693.302083333336 | 30.3 |
| 44693.3125 | 30.32 |
| 44693.322916666664 | 30.33 |
| 44693.333333333336 | 30.34 |
| 44693.34375 | 30.34 |
| 44693.354166666664 | 30.35 |
| 44693.364583333336 | 30.34 |
| 44693.375 | 30.34 |
| 44693.385416666664 | 30.34 |
| 44693.395833333336 | 30.34 |
| 44693.40625 | 30.34 |
| 44693.416666666664 | 30.32 |
| 44693.427083333336 | 30.33 |
| 44693.4375 | 30.29 |
| 44693.447916666664 | 30.3 |
| 44693.458333333336 | 30.29 |
| 44693.46875 | 30.32 |
| 44693.479166666664 | 30.31 |
| 44693.489583333336 | 30.31 |
| 44693.5 | 30.3 |
| 44693.510416666664 | 30.29 |
| 44693.520833333336 | 30.26 |
| 44693.53125 | 30.25 |
| 44693.541666666664 | 30.25 |
| 44693.552083333336 | 30.25 |
| 44693.5625 | 30.24 |
| 44693.572916666664 | 30.23 |
| 44693.583333333336 | 30.22 |
| 44693.59375 | 30.19 |
| 44693.604166666664 | 30.17 |
| 44693.614583333336 | 30.17 |
| 44693.625 | 30.17 |
| 44693.635416666664 | 30.15 |
| 44693.645833333336 | 30.15 |
| 44693.65625 | 30.13 |
| 44693.666666666664 | 30.08 |
| 44693.677083333336 | 30 |
| 44693.6875 | 29.87 |
| 44693.697916666664 | 29.8 |
| 44693.708333333336 | 29.68 |
| 44693.71875 | 29.67 |
| 44693.729166666664 | 29.68 |
| 44693.739583333336 | 29.77 |
| 44693.75 | 29.74 |
| 44693.760416666664 | 29.77 |
| 44693.770833333336 | 29.85 |
| 44693.78125 | 29.93 |
| 44693.791666666664 | 30.01 |
| 44693.802083333336 | 30.08 |
| 44693.8125 | 30.13 |
| 44693.822916666664 | 30.14 |
| 44693.833333333336 | 30.16 |
| 44693.84375 | 30.18 |
| 44693.854166666664 | 30.19 |
| 44693.864583333336 | 30.19 |
| 44693.875 | 30.21 |
| 44693.885416666664 | 30.22 |
| 44693.895833333336 | 30.23 |
| 44693.90625 | 30.24 |
| 44693.916666666664 | 30.21 |
| 44693.927083333336 | 30.22 |
| 44693.9375 | 30.15 |
| 44693.947916666664 | 30.1 |
| 44693.958333333336 | 30.24 |
| 44693.96875 | 30.16 |
| 44693.979166666664 | 30.11 |
| 44693.989583333336 | 30.17 |
| 44694.0 | 30.15 |
| 44694.010416666664 | 30.16 |
| 44694.020833333336 | 30.14 |
| 44694.03125 | 30.13 |
| 44694.041666666664 | 30.12 |
| 44694.052083333336 | 30.11 |
| 44694.0625 | 30.11 |
| 44694.072916666664 | 30.09 |
| 44694.083333333336 | 30.07 |
| 44694.09375 | 30.06 |
| 44694.104166666664 | 30.05 |
| 44694.114583333336 | 30.02 |
| 44694.125 | 29.97 |
| 44694.135416666664 | 29.94 |
| 44694.145833333336 | 29.94 |
| 44694.15625 | 29.94 |
| 44694.166666666664 | 29.91 |
| 44694.177083333336 | 29.87 |
| 44694.1875 | 29.75 |
| 44694.197916666664 | 29.62 |
| 44694.208333333336 | 29.55 |
| 44694.21875 | 29.51 |
| 44694.229166666664 | 29.47 |
| 44694.239583333336 | 29.52 |
| 44694.25 | 29.59 |
| 44694.260416666664 | 29.59 |
| 44694.270833333336 | 29.64 |
| 44694.28125 | 29.71 |
| 44694.291666666664 | 29.73 |
| 44694.302083333336 | 29.76 |
| 44694.3125 | 29.77 |
| 44694.322916666664 | 29.76 |
| 44694.333333333336 | 29.77 |
| 44694.34375 | 29.79 |
| 44694.354166666664 | 29.79 |
| 44694.364583333336 | 29.79 |
| 44694.375 | 29.78 |
| 44694.385416666664 | 29.78 |
| 44694.395833333336 | 29.79 |
| 44694.40625 | 29.79 |
| 44694.416666666664 | 29.8 |
| 44694.427083333336 | 29.81 |
| 44694.4375 | 29.81 |
| 44694.447916666664 | 29.78 |
| 44694.458333333336 | 29.77 |
| 44694.46875 | 29.78 |
| 44694.479166666664 | 29.69 |
| 44694.489583333336 | 29.59 |
| 44694.5 | 29.56 |
| 44694.510416666664 | 29.64 |
| 44694.520833333336 | 29.6 |
| 44694.53125 | 29.61 |
| 44694.541666666664 | 29.63 |
| 44694.552083333336 | 29.54 |
| 44694.5625 | 29.44 |
| 44694.572916666664 | 29.41 |
| 44694.583333333336 | 29.27 |
| 44694.59375 | 29.13 |
| 44694.604166666664 | 29.1 |
| 44694.614583333336 | 29.09 |
| 44694.625 | 29 |
| 44694.635416666664 | 28.93 |
| 44694.645833333336 | 28.85 |
| 44694.65625 | 28.76 |
| 44694.666666666664 | 28.66 |
| 44694.677083333336 | 28.54 |
| 44694.6875 | 28.42 |
| 44694.697916666664 | 28.24 |
| 44694.708333333336 | 28.14 |
| 44694.71875 | 28.19 |
| 44694.729166666664 | 28.21 |
| 44694.739583333336 | 28.32 |
| 44694.75 | 28.34 |
| 44694.760416666664 | 28.43 |
| 44694.770833333336 | 28.54 |
| 44694.78125 | 28.66 |
| 44694.791666666664 | 28.84 |
| 44694.802083333336 | 29 |
| 44694.8125 | 29.11 |
| 44694.822916666664 | 29.13 |
| 44694.833333333336 | 29.15 |
| 44694.84375 | 29.17 |
| 44694.854166666664 | 29.28 |
| 44694.864583333336 | 29.36 |
| 44694.875 | 29.38 |
| 44694.885416666664 | 29.43 |
| 44694.895833333336 | 29.46 |
| 44694.90625 | 29.52 |
| 44694.916666666664 | 29.61 |
| 44694.927083333336 | 29.66 |
| 44694.9375 | 29.69 |
| 44694.947916666664 | 29.71 |
| 44694.958333333336 | 29.73 |
| 44694.96875 | 29.74 |
| 44694.979166666664 | 29.74 |
| 44694.989583333336 | 29.74 |
| 44695.0 | 29.73 |
| 44695.010416666664 | 29.67 |
| 44695.020833333336 | 29.46 |
| 44695.03125 | 29.46 |
| 44695.041666666664 | 29.65 |
| 44695.052083333336 | 29.56 |
| 44695.0625 | 29.58 |
| 44695.072916666664 | 29.56 |
| 44695.083333333336 | 29.52 |
| 44695.09375 | 29.51 |
| 44695.104166666664 | 29.42 |
| 44695.114583333336 | 29.33 |
| 44695.125 | 29.23 |
| 44695.135416666664 | 29.1 |
| 44695.145833333336 | 29.05 |
| 44695.15625 | 28.98 |
| 44695.166666666664 | 28.8 |
| 44695.177083333336 | 28.59 |
| 44695.1875 | 28.32 |
| 44695.197916666664 | 28.13 |
| 44695.208333333336 | 27.86 |
| 44695.21875 | 27.67 |
| 44695.229166666664 | 27.43 |
| 44695.239583333336 | 27.11 |
| 44695.25 | 27.15 |
| 44695.260416666664 | 27.21 |
| 44695.270833333336 | 27.38 |
| 44695.28125 | 27.51 |
| 44695.291666666664 | 27.64 |
| 44695.302083333336 | 27.84 |
| 44695.3125 | 28.09 |
| 44695.322916666664 | 28.42 |
| 44695.333333333336 | 28.71 |
| 44695.34375 | 28.86 |
| 44695.354166666664 | 28.98 |
| 44695.364583333336 | 29.08 |
| 44695.375 | 29.14 |
| 44695.385416666664 | 29.22 |
| 44695.395833333336 | 29.29 |
| 44695.40625 | 29.34 |
| 44695.416666666664 | 29.39 |
| 44695.427083333336 | 29.43 |
| 44695.4375 | 29.46 |
| 44695.447916666664 | 29.48 |
| 44695.458333333336 | 29.49 |
| 44695.46875 | 29.51 |
| 44695.479166666664 | 29.51 |
| 44695.489583333336 | 29.51 |
| 44695.5 | 29.52 |
| 44695.510416666664 | 29.42 |
| 44695.520833333336 | 29.38 |
| 44695.53125 | 29.46 |
| 44695.541666666664 | 29.42 |
| 44695.552083333336 | 29.41 |
| 44695.5625 | 29.39 |
| 44695.572916666664 | 29.39 |
| 44695.583333333336 | 29.32 |
| 44695.59375 | 29.17 |
| 44695.604166666664 | 29.09 |
| 44695.614583333336 | 28.95 |
| 44695.625 | 28.82 |
| 44695.635416666664 | 28.7 |
| 44695.645833333336 | 28.51 |
| 44695.65625 | 27.84 |
| 44695.666666666664 | 27.09 |
| 44695.677083333336 | 26.81 |
| 44695.6875 | 26.1 |
| 44695.697916666664 | 26.09 |
| 44695.708333333336 | 25.58 |
| 44695.71875 | 24.91 |
| 44695.729166666664 | 25.03 |
| 44695.739583333336 | 25.57 |
| 44695.75 | 25.58 |
| 44695.760416666664 | 24.95 |
| 44695.770833333336 | 25.25 |
| 44695.78125 | 25.54 |
| 44695.791666666664 | 25.79 |
| 44695.802083333336 | 26.11 |
| 44695.8125 | 26.65 |
| 44695.822916666664 | 27.24 |
| 44695.833333333336 | 27.65 |
| 44695.84375 | 27.97 |
| 44695.854166666664 | 28.2 |
| 44695.864583333336 | 28.37 |
| 44695.875 | 28.49 |
| 44695.885416666664 | 28.64 |
| 44695.895833333336 | 28.73 |
| 44695.90625 | 28.84 |
| 44695.916666666664 | 28.91 |
| 44695.927083333336 | 28.98 |
| 44695.9375 | 29 |
| 44695.947916666664 | 29.04 |
| 44695.958333333336 | 29.05 |
| 44695.96875 | 29.07 |
| 44695.979166666664 | 29.09 |
| 44695.989583333336 | 29.12 |
| 44696.0 | 29.15 |
| 44696.010416666664 | 29.17 |
| 44696.020833333336 | 29.19 |
| 44696.03125 | 29.21 |
| 44696.041666666664 | 29.17 |
| 44696.052083333336 | 28.95 |
| 44696.0625 | 28.8 |
| 44696.072916666664 | 28.85 |
| 44696.083333333336 | 28.85 |
| 44696.09375 | 28.72 |
| 44696.104166666664 | 28.66 |
| 44696.114583333336 | 28.68 |
| 44696.125 | 28.69 |
| 44696.135416666664 | 28.64 |
| 44696.145833333336 | 28.55 |
| 44696.15625 | 28.37 |
| 44696.166666666664 | 28.18 |
| 44696.177083333336 | 28.05 |
| 44696.1875 | 27.83 |
| 44696.197916666664 | 27.54 |
| 44696.208333333336 | 27.09 |
| 44696.21875 | 26.79 |
| 44696.229166666664 | 26.42 |
| 44696.239583333336 | 26.1 |
| 44696.25 | 25.79 |
| 44696.260416666664 | 25.51 |
| 44696.270833333336 | 25.27 |
| 44696.28125 | 25.05 |
| 44696.291666666664 | 25.03 |
| 44696.302083333336 | 25.24 |
| 44696.3125 | 25.41 |
| 44696.322916666664 | 25.59 |
| 44696.333333333336 | 25.91 |
| 44696.34375 | 26.35 |
| 44696.354166666664 | 27.12 |
| 44696.364583333336 | 27.56 |
| 44696.375 | 27.63 |
| 44696.385416666664 | 27.82 |
| 44696.395833333336 | 27.94 |
| 44696.40625 | 28.06 |
| 44696.416666666664 | 28.22 |
| 44696.427083333336 | 28.35 |
| 44696.4375 | 28.51 |
| 44696.447916666664 | 28.65 |
| 44696.458333333336 | 28.76 |
| 44696.46875 | 28.83 |
| 44696.479166666664 | 28.89 |
| 44696.489583333336 | 28.92 |
| 44696.5 | 28.95 |
| 44696.510416666664 | 28.97 |
| 44696.520833333336 | 29 |
| 44696.53125 | 28.98 |
| 44696.541666666664 | 28.97 |
| 44696.552083333336 | 28.91 |
| 44696.5625 | 28.95 |
| 44696.572916666664 | 28.89 |
| 44696.583333333336 | 28.8 |
| 44696.59375 | 28.54 |
| 44696.604166666664 | 28.44 |
| 44696.614583333336 | 28.3 |
| 44696.625 | 28.18 |
| 44696.635416666664 | 28.1 |
| 44696.645833333336 | 28.03 |
| 44696.65625 | 28.03 |
| 44696.666666666664 | 27.79 |
| 44696.677083333336 | 27.68 |
| 44696.6875 | 27.02 |
| 44696.697916666664 | 26.59 |
| 44696.708333333336 | 26.08 |
| 44696.71875 | 25.86 |
| 44696.729166666664 | 25.56 |
| 44696.739583333336 | 25.57 |
| 44696.75 | 25.53 |
| 44696.760416666664 | 25.41 |
| 44696.770833333336 | 25.4 |
| 44696.78125 | 25.37 |
| 44696.791666666664 | 25.45 |
| 44696.802083333336 | 25.49 |
| 44696.8125 | 25.4 |
| 44696.822916666664 | 25.52 |
| 44696.833333333336 | 25.71 |
| 44696.84375 | 26.25 |
| 44696.854166666664 | 26.87 |
| 44696.864583333336 | 27.22 |
| 44696.875 | 27.5 |
| 44696.885416666664 | 27.72 |
| 44696.895833333336 | 27.98 |
| 44696.90625 | 28.21 |
| 44696.916666666664 | 28.45 |
| 44696.927083333336 | 28.61 |
| 44696.9375 | 28.77 |
| 44696.947916666664 | 28.87 |
| 44696.958333333336 | 28.93 |
| 44696.96875 | 28.96 |
| 44696.979166666664 | 28.99 |
| 44696.989583333336 | 29.01 |
| 44697.0 | 29.02 |
| 44697.010416666664 | 29.04 |
| 44697.020833333336 | 29.06 |
| 44697.03125 | 29.08 |
| 44697.041666666664 | 29.09 |
| 44697.052083333336 | 29.1 |
| 44697.0625 | 29.11 |
| 44697.072916666664 | 29.1 |
| 44697.083333333336 | 29.05 |
| 44697.09375 | 29.05 |
| 44697.104166666664 | 29.03 |
| 44697.114583333336 | 28.97 |
| 44697.125 | 28.98 |
| 44697.135416666664 | 28.93 |
| 44697.145833333336 | 28.86 |
| 44697.15625 | 28.82 |
| 44697.166666666664 | 28.79 |
| 44697.177083333336 | 28.71 |
| 44697.1875 | 28.68 |
| 44697.197916666664 | 28.51 |
| 44697.208333333336 | 28.38 |
| 44697.21875 | 28.28 |
| 44697.229166666664 | 28.07 |
| 44697.239583333336 | 27.68 |
| 44697.25 | 27.32 |
| 44697.260416666664 | 26.97 |
| 44697.270833333336 | 26.69 |
| 44697.28125 | 26.32 |
| 44697.291666666664 | 26.04 |
| 44697.302083333336 | 25.69 |
| 44697.3125 | 25.45 |
| 44697.322916666664 | 25.37 |
| 44697.333333333336 | 25.57 |
| 44697.34375 | 25.77 |
| 44697.354166666664 | 25.9 |
| 44697.364583333336 | 26.18 |
| 44697.375 | 26.5 |
| 44697.385416666664 | 27.14 |
| 44697.395833333336 | 27.54 |
| 44697.40625 | 27.8 |
| 44697.416666666664 | 27.99 |
| 44697.427083333336 | 28.16 |
| 44697.4375 | 28.31 |
| 44697.447916666664 | 28.43 |
| 44697.458333333336 | 28.55 |
| 44697.46875 | 28.68 |
| 44697.479166666664 | 28.77 |
| 44697.489583333336 | 28.85 |
| 44697.5 | 28.91 |
| 44697.510416666664 | 28.95 |
| 44697.520833333336 | 28.97 |
| 44697.53125 | 28.99 |
| 44697.541666666664 | 29.01 |
| 44697.552083333336 | 29.02 |
| 44697.5625 | 29.04 |
| 44697.572916666664 | 29.05 |
| 44697.583333333336 | 29.01 |
| 44697.59375 | 28.89 |
| 44697.604166666664 | 28.96 |
| 44697.614583333336 | 28.97 |
| 44697.625 | 28.83 |
| 44697.635416666664 | 28.87 |
| 44697.645833333336 | 28.75 |
| 44697.65625 | 28.54 |
| 44697.666666666664 | 28.53 |
| 44697.677083333336 | 28.45 |
| 44697.6875 | 28.34 |
| 44697.697916666664 | 28.38 |
| 44697.708333333336 | 28.3 |
| 44697.71875 | 28.18 |
| 44697.729166666664 | 27.86 |
| 44697.739583333336 | 27.6 |
| 44697.75 | 27.35 |
| 44697.760416666664 | 27.19 |
| 44697.770833333336 | 26.95 |
| 44697.78125 | 26.79 |
| 44697.791666666664 | 26.55 |
| 44697.802083333336 | 26.46 |
| 44697.8125 | 26.37 |
| 44697.822916666664 | 26.14 |
| 44697.833333333336 | 26.23 |
| 44697.84375 | 26.41 |
| 44697.854166666664 | 26.71 |
| 44697.864583333336 | 26.95 |
| 44697.875 | 27.28 |
| 44697.885416666664 | 27.7 |
| 44697.895833333336 | 27.96 |
| 44697.90625 | 28.1 |
| 44697.916666666664 | 28.23 |
| 44697.927083333336 | 28.42 |
| 44697.9375 | 28.56 |
| 44697.947916666664 | 28.67 |
| 44697.958333333336 | 28.77 |
| 44697.96875 | 28.84 |
| 44697.979166666664 | 28.94 |
| 44697.989583333336 | 29.02 |
| 44698.0 | 29.06 |
| 44698.010416666664 | 29.09 |
| 44698.020833333336 | 29.14 |
| 44698.03125 | 29.17 |
| 44698.041666666664 | 29.19 |
| 44698.052083333336 | 29.2 |
| 44698.0625 | 29.22 |
| 44698.072916666664 | 29.22 |
| 44698.083333333336 | 29.22 |
| 44698.09375 | 29.23 |
| 44698.104166666664 | 29.23 |
| 44698.114583333336 | 29.19 |
| 44698.125 | 29.2 |
| 44698.135416666664 | 29.15 |
| 44698.145833333336 | 29.12 |
| 44698.15625 | 29.12 |
| 44698.166666666664 | 29.06 |
| 44698.177083333336 | 28.98 |
| 44698.1875 | 28.88 |
| 44698.197916666664 | 28.82 |
| 44698.208333333336 | 28.77 |
| 44698.21875 | 28.68 |
| 44698.229166666664 | 28.6 |
| 44698.239583333336 | 28.53 |
| 44698.25 | 28.4 |
| 44698.260416666664 | 28.23 |
| 44698.270833333336 | 27.91 |
| 44698.28125 | 27.55 |
| 44698.291666666664 | 27.28 |
| 44698.302083333336 | 26.96 |
| 44698.3125 | 26.64 |
| 44698.322916666664 | 26.36 |
| 44698.333333333336 | 26.08 |
| 44698.34375 | 25.86 |
| 44698.354166666664 | 25.8 |
| 44698.364583333336 | 25.71 |
| 44698.375 | 25.95 |
| 44698.385416666664 | 25.97 |
| 44698.395833333336 | 26.14 |
| 44698.40625 | 26.38 |
| 44698.416666666664 | 26.97 |
| 44698.427083333336 | 27.45 |
| 44698.4375 | 27.76 |
| 44698.447916666664 | 27.95 |
| 44698.458333333336 | 28.09 |
| 44698.46875 | 28.2 |
| 44698.479166666664 | 28.31 |
| 44698.489583333336 | 28.42 |
| 44698.5 | 28.54 |
| 44698.510416666664 | 28.72 |
| 44698.520833333336 | 28.86 |
| 44698.53125 | 28.96 |
| 44698.541666666664 | 29.05 |
| 44698.552083333336 | 29.11 |
| 44698.5625 | 29.16 |
| 44698.572916666664 | 29.18 |
| 44698.583333333336 | 29.2 |
| 44698.59375 | 29.21 |
| 44698.604166666664 | 29.19 |
| 44698.614583333336 | 29.12 |
| 44698.625 | 29.16 |
| 44698.635416666664 | 29.16 |
| 44698.645833333336 | 29.15 |
| 44698.65625 | 29.1 |
| 44698.666666666664 | 29.03 |
| 44698.677083333336 | 28.96 |
| 44698.6875 | 28.86 |
| 44698.697916666664 | 28.84 |
| 44698.708333333336 | 28.85 |
| 44698.71875 | 28.75 |
| 44698.729166666664 | 28.65 |
| 44698.739583333336 | 28.42 |
| 44698.75 | 28.33 |
| 44698.760416666664 | 27.94 |
| 44698.770833333336 | 27.4 |
| 44698.78125 | 26.97 |
| 44698.791666666664 | 26.65 |
| 44698.802083333336 | 26.24 |
| 44698.8125 | 26 |
| 44698.822916666664 | 25.89 |
| 44698.833333333336 | 25.71 |
| 44698.84375 | 25.67 |
| 44698.854166666664 | 25.68 |
| 44698.864583333336 | 25.8 |
| 44698.875 | 25.97 |
| 44698.885416666664 | 26.04 |
| 44698.895833333336 | 26.31 |
| 44698.90625 | 26.93 |
| 44698.916666666664 | 27.52 |
| 44698.927083333336 | 27.88 |
| 44698.9375 | 28.15 |
| 44698.947916666664 | 28.36 |
| 44698.958333333336 | 28.49 |
| 44698.96875 | 28.65 |
| 44698.979166666664 | 28.76 |
| 44698.989583333336 | 28.93 |
| 44699.0 | 29.08 |
| 44699.010416666664 | 29.19 |
| 44699.020833333336 | 29.27 |
| 44699.03125 | 29.3 |
| 44699.041666666664 | 29.33 |
| 44699.052083333336 | 29.34 |
| 44699.0625 | 29.36 |
| 44699.072916666664 | 29.38 |
| 44699.083333333336 | 29.39 |
| 44699.09375 | 29.41 |
| 44699.104166666664 | 29.43 |
| 44699.114583333336 | 29.44 |
| 44699.125 | 29.45 |
| 44699.135416666664 | 29.46 |
| 44699.145833333336 | 29.45 |
| 44699.15625 | 29.43 |
| 44699.166666666664 | 29.42 |
| 44699.177083333336 | 29.37 |
| 44699.1875 | 29.35 |
| 44699.197916666664 | 29.33 |
| 44699.208333333336 | 29.3 |
| 44699.21875 | 29.25 |
| 44699.229166666664 | 29.21 |
| 44699.239583333336 | 29.13 |
| 44699.25 | 29.09 |
| 44699.260416666664 | 29.04 |
| 44699.270833333336 | 29 |
| 44699.28125 | 28.88 |
| 44699.291666666664 | 28.64 |
| 44699.302083333336 | 28.35 |
| 44699.3125 | 28.1 |
| 44699.322916666664 | 27.86 |
| 44699.333333333336 | 27.65 |
| 44699.34375 | 27.41 |
| 44699.354166666664 | 27.19 |
| 44699.364583333336 | 26.9 |
| 44699.375 | 26.87 |
| 44699.385416666664 | 26.6 |
| 44699.395833333336 | 26.59 |
| 44699.40625 | 26.67 |
| 44699.416666666664 | 26.79 |
| 44699.427083333336 | 26.8 |
| 44699.4375 | 26.99 |
| 44699.447916666664 | 27.18 |
| 44699.458333333336 | 27.56 |
| 44699.46875 | 28.02 |
| 44699.479166666664 | 28.28 |
| 44699.489583333336 | 28.39 |
| 44699.5 | 28.49 |
| 44699.510416666664 | 28.54 |
| 44699.520833333336 | 28.69 |
| 44699.53125 | 28.83 |
| 44699.541666666664 | 28.97 |
| 44699.552083333336 | 29.1 |
| 44699.5625 | 29.21 |
| 44699.572916666664 | 29.27 |
| 44699.583333333336 | 29.32 |
| 44699.59375 | 29.36 |
| 44699.604166666664 | 29.41 |
| 44699.614583333336 | 29.44 |
| 44699.625 | 29.47 |
| 44699.635416666664 | 29.49 |
| 44699.645833333336 | 29.46 |
| 44699.65625 | 29.3 |
| 44699.666666666664 | 29.31 |
| 44699.677083333336 | 29.26 |
| 44699.6875 | 29.26 |
| 44699.697916666664 | 29.29 |
| 44699.708333333336 | 29.21 |
| 44699.71875 | 29.04 |
| 44699.729166666664 | 28.96 |
| 44699.739583333336 | 28.94 |
| 44699.75 | 28.95 |
| 44699.760416666664 | 28.91 |
| 44699.770833333336 | 28.74 |
| 44699.78125 | 28.74 |
| 44699.791666666664 | 28.64 |
| 44699.802083333336 | 28.43 |
| 44699.8125 | 28.31 |
| 44699.822916666664 | 28.1 |
| 44699.833333333336 | 27.92 |
| 44699.84375 | 27.67 |
| 44699.854166666664 | 27.37 |
| 44699.864583333336 | 27.22 |
| 44699.875 | 27.11 |
| 44699.885416666664 | 27.09 |
| 44699.895833333336 | 27.1 |
| 44699.90625 | 27.22 |
| 44699.916666666664 | 27.3 |
| 44699.927083333336 | 27.49 |
| 44699.9375 | 27.72 |
| 44699.947916666664 | 28.1 |
| 44699.958333333336 | 28.46 |
| 44699.96875 | 28.67 |
| 44699.979166666664 | 28.8 |
| 44699.989583333336 | 28.88 |
| 44700.0 | 28.98 |
| 44700.010416666664 | 29.13 |
| 44700.020833333336 | 29.26 |
| 44700.03125 | 29.35 |
| 44700.041666666664 | 29.42 |
| 44700.052083333336 | 29.5 |
| 44700.0625 | 29.54 |
| 44700.072916666664 | 29.58 |
| 44700.083333333336 | 29.6 |
| 44700.09375 | 29.62 |
| 44700.104166666664 | 29.65 |
| 44700.114583333336 | 29.67 |
| 44700.125 | 29.69 |
| 44700.135416666664 | 29.71 |
| 44700.145833333336 | 29.71 |
| 44700.15625 | 29.73 |
| 44700.166666666664 | 29.74 |
| 44700.177083333336 | 29.71 |
| 44700.1875 | 29.65 |
| 44700.197916666664 | 29.65 |
| 44700.208333333336 | 29.6 |
| 44700.21875 | 29.7 |
| 44700.229166666664 | 29.7 |
| 44700.239583333336 | 29.68 |
| 44700.25 | 29.65 |
| 44700.260416666664 | 29.61 |
| 44700.270833333336 | 29.56 |
| 44700.28125 | 29.52 |
| 44700.291666666664 | 29.49 |
| 44700.302083333336 | 29.41 |
| 44700.3125 | 29.41 |
| 44700.322916666664 | 29.34 |
| 44700.333333333336 | 29.29 |
| 44700.34375 | 29.13 |
| 44700.354166666664 | 29.02 |
| 44700.364583333336 | 28.77 |
| 44700.375 | 28.52 |
| 44700.385416666664 | 28.29 |
| 44700.395833333336 | 28.07 |
| 44700.40625 | 27.88 |
| 44700.416666666664 | 27.62 |
| 44700.427083333336 | 27.54 |
| 44700.4375 | 27.71 |
| 44700.447916666664 | 27.8 |
| 44700.458333333336 | 27.82 |
| 44700.46875 | 27.93 |
| 44700.479166666664 | 28.12 |
| 44700.489583333336 | 28.33 |
| 44700.5 | 28.64 |
| 44700.510416666664 | 28.84 |
| 44700.520833333336 | 28.93 |
| 44700.53125 | 29.03 |
| 44700.541666666664 | 29.08 |
| 44700.552083333336 | 29.14 |
| 44700.5625 | 29.2 |
| 44700.572916666664 | 29.27 |
| 44700.583333333336 | 29.34 |
| 44700.59375 | 29.41 |
| 44700.604166666664 | 29.48 |
| 44700.614583333336 | 29.55 |
| 44700.625 | 29.62 |
| 44700.635416666664 | 29.67 |
| 44700.645833333336 | 29.72 |
| 44700.65625 | 29.73 |
| 44700.666666666664 | 29.75 |
| 44700.677083333336 | 29.75 |
| 44700.6875 | 29.67 |
| 44700.697916666664 | 29.73 |
| 44700.708333333336 | 29.71 |
| 44700.71875 | 29.7 |
| 44700.729166666664 | 29.67 |
| 44700.739583333336 | 29.62 |
| 44700.75 | 29.59 |
| 44700.760416666664 | 29.5 |
| 44700.770833333336 | 29.47 |
| 44700.78125 | 29.49 |
| 44700.791666666664 | 29.31 |
| 44700.802083333336 | 29.26 |
| 44700.8125 | 29.12 |
| 44700.822916666664 | 28.87 |
| 44700.833333333336 | 28.66 |
| 44700.84375 | 28.41 |
| 44700.854166666664 | 28.27 |
| 44700.864583333336 | 28.21 |
| 44700.875 | 27.83 |
| 44700.885416666664 | 27.44 |
| 44700.895833333336 | 27.23 |
| 44700.90625 | 27.1 |
| 44700.916666666664 | 27.05 |
| 44700.927083333336 | 27.05 |
| 44700.9375 | 27.17 |
| 44700.947916666664 | 27.3 |
| 44700.958333333336 | 27.47 |
| 44700.96875 | 27.73 |
| 44700.979166666664 | 28.1 |
| 44700.989583333336 | 28.53 |
| 44701.0 | 28.86 |
| 44701.010416666664 | 29.05 |
| 44701.020833333336 | 29.15 |
| 44701.03125 | 29.27 |
| 44701.041666666664 | 29.39 |
| 44701.052083333336 | 29.51 |
| 44701.0625 | 29.56 |
| 44701.072916666664 | 29.64 |
| 44701.083333333336 | 29.74 |
| 44701.09375 | 29.8 |
| 44701.104166666664 | 29.85 |
| 44701.114583333336 | 29.89 |
| 44701.125 | 29.91 |
| 44701.135416666664 | 29.93 |
| 44701.145833333336 | 29.95 |
| 44701.15625 | 29.96 |
| 44701.166666666664 | 29.98 |
| 44701.177083333336 | 30 |
| 44701.1875 | 29.99 |
| 44701.197916666664 | 30.01 |
| 44701.208333333336 | 30.01 |
| 44701.21875 | 29.98 |
| 44701.229166666664 | 29.98 |
| 44701.239583333336 | 29.97 |
| 44701.25 | 29.94 |
| 44701.260416666664 | 29.91 |
| 44701.270833333336 | 29.9 |
| 44701.28125 | 29.88 |
| 44701.291666666664 | 29.84 |
| 44701.302083333336 | 29.77 |
| 44701.3125 | 29.77 |
| 44701.322916666664 | 29.73 |
| 44701.333333333336 | 29.65 |
| 44701.34375 | 29.62 |
| 44701.354166666664 | 29.58 |
| 44701.364583333336 | 29.52 |
| 44701.375 | 29.42 |
| 44701.385416666664 | 29.27 |
| 44701.395833333336 | 29.09 |
| 44701.40625 | 28.85 |
| 44701.416666666664 | 28.7 |
| 44701.427083333336 | 28.51 |
| 44701.4375 | 28.37 |
| 44701.447916666664 | 28.23 |
| 44701.458333333336 | 28.08 |
| 44701.46875 | 27.99 |
| 44701.479166666664 | 28.03 |
| 44701.489583333336 | 28.21 |
| 44701.5 | 28.24 |
| 44701.510416666664 | 28.33 |
| 44701.520833333336 | 28.47 |
| 44701.53125 | 28.67 |
| 44701.541666666664 | 29.01 |
| 44701.552083333336 | 29.23 |
| 44701.5625 | 29.3 |
| 44701.572916666664 | 29.31 |
| 44701.583333333336 | 29.37 |
| 44701.59375 | 29.44 |
| 44701.604166666664 | 29.5 |
| 44701.614583333336 | 29.56 |
| 44701.625 | 29.63 |
| 44701.635416666664 | 29.68 |
| 44701.645833333336 | 29.72 |
| 44701.65625 | 29.77 |
| 44701.666666666664 | 29.8 |
| 44701.677083333336 | 29.83 |
| 44701.6875 | 29.85 |
| 44701.697916666664 | 29.88 |
| 44701.708333333336 | 29.88 |
| 44701.71875 | 29.88 |
| 44701.729166666664 | 29.66 |
| 44701.739583333336 | 29.73 |
| 44701.75 | 29.74 |
| 44701.760416666664 | 29.72 |
| 44701.770833333336 | 29.7 |
| 44701.78125 | 29.7 |
| 44701.791666666664 | 29.61 |
| 44701.802083333336 | 29.61 |
| 44701.8125 | 29.48 |
| 44701.822916666664 | 29.51 |
| 44701.833333333336 | 29.5 |
| 44701.84375 | 29.42 |
| 44701.854166666664 | 29.48 |
| 44701.864583333336 | 29.41 |
| 44701.875 | 29.36 |
| 44701.885416666664 | 29.19 |
| 44701.895833333336 | 29.14 |
| 44701.90625 | 28.94 |
| 44701.916666666664 | 28.75 |
| 44701.927083333336 | 28.59 |
| 44701.9375 | 28.47 |
| 44701.947916666664 | 28.39 |
| 44701.958333333336 | 28.38 |
| 44701.96875 | 28.39 |
| 44701.979166666664 | 28.47 |
| 44701.989583333336 | 28.56 |
| 44702.0 | 28.63 |
| 44702.010416666664 | 28.77 |
| 44702.020833333336 | 28.97 |
| 44702.03125 | 29.21 |
| 44702.041666666664 | 29.37 |
| 44702.052083333336 | 29.45 |
| 44702.0625 | 29.53 |
| 44702.072916666664 | 29.62 |
| 44702.083333333336 | 29.69 |
| 44702.09375 | 29.78 |
| 44702.104166666664 | 29.81 |
| 44702.114583333336 | 29.85 |
| 44702.125 | 29.86 |
| 44702.135416666664 | 29.89 |
| 44702.145833333336 | 29.92 |
| 44702.15625 | 29.97 |
| 44702.166666666664 | 29.99 |
| 44702.177083333336 | 30.01 |
| 44702.1875 | 30.02 |
| 44702.197916666664 | 30.06 |
| 44702.208333333336 | 30.06 |
| 44702.21875 | 30.07 |
| 44702.229166666664 | 30.07 |
| 44702.239583333336 | 30.08 |
| 44702.25 | 30.05 |
| 44702.260416666664 | 30.03 |
| 44702.270833333336 | 30.04 |
| 44702.28125 | 30.03 |
| 44702.291666666664 | 30.01 |
| 44702.302083333336 | 29.98 |
| 44702.3125 | 29.96 |
| 44702.322916666664 | 29.93 |
| 44702.333333333336 | 29.92 |
| 44702.34375 | 29.93 |
| 44702.354166666664 | 29.89 |
| 44702.364583333336 | 29.83 |
| 44702.375 | 29.81 |
| 44702.385416666664 | 29.76 |
| 44702.395833333336 | 29.69 |
| 44702.40625 | 29.63 |
| 44702.416666666664 | 29.42 |
| 44702.427083333336 | 29.18 |
| 44702.4375 | 28.99 |
| 44702.447916666664 | 28.91 |
| 44702.458333333336 | 28.71 |
| 44702.46875 | 28.63 |
| 44702.479166666664 | 28.43 |
| 44702.489583333336 | 28.34 |
| 44702.5 | 28.28 |
| 44702.510416666664 | 28.3 |
| 44702.520833333336 | 28.41 |
| 44702.53125 | 28.51 |
| 44702.541666666664 | 28.55 |
| 44702.552083333336 | 28.67 |
| 44702.5625 | 28.82 |
| 44702.572916666664 | 29.08 |
| 44702.583333333336 | 29.3 |
| 44702.59375 | 29.39 |
| 44702.604166666664 | 29.47 |
| 44702.614583333336 | 29.53 |
| 44702.625 | 29.61 |
| 44702.635416666664 | 29.67 |
| 44702.645833333336 | 29.73 |
| 44702.65625 | 29.8 |
| 44702.666666666664 | 29.87 |
| 44702.677083333336 | 29.93 |
| 44702.6875 | 29.96 |
| 44702.697916666664 | 30.01 |
| 44702.708333333336 | 30.05 |
| 44702.71875 | 30.1 |
| 44702.729166666664 | 30.1 |
| 44702.739583333336 | 30.14 |
| 44702.75 | 30.13 |
| 44702.760416666664 | 30.16 |
| 44702.770833333336 | 29.96 |
| 44702.78125 | 30.02 |
| 44702.791666666664 | 30.05 |
| 44702.802083333336 | 30.07 |
| 44702.8125 | 30.03 |
| 44702.822916666664 | 30.08 |
| 44702.833333333336 | 30.02 |
| 44702.84375 | 29.96 |
| 44702.854166666664 | 29.95 |
| 44702.864583333336 | 29.97 |
| 44702.875 | 29.89 |
| 44702.885416666664 | 29.93 |
| 44702.895833333336 | 29.93 |
| 44702.90625 | 29.69 |
| 44702.916666666664 | 29.54 |
| 44702.927083333336 | 29.29 |
| 44702.9375 | 29.19 |
| 44702.947916666664 | 29.08 |
| 44702.958333333336 | 28.93 |
| 44702.96875 | 28.76 |
| 44702.979166666664 | 28.68 |
| 44702.989583333336 | 28.63 |
| 44703.0 | 28.63 |
| 44703.010416666664 | 28.66 |
| 44703.020833333336 | 28.76 |
| 44703.03125 | 28.81 |
| 44703.041666666664 | 28.92 |
| 44703.052083333336 | 29.08 |
| 44703.0625 | 29.32 |
| 44703.072916666664 | 29.57 |
| 44703.083333333336 | 29.73 |
| 44703.09375 | 29.81 |
| 44703.104166666664 | 29.89 |
| 44703.114583333336 | 29.96 |
| 44703.125 | 30.02 |
| 44703.135416666664 | 30.08 |
| 44703.145833333336 | 30.12 |
| 44703.15625 | 30.13 |
| 44703.166666666664 | 30.15 |
| 44703.177083333336 | 30.15 |
| 44703.1875 | 30.18 |
| 44703.197916666664 | 30.23 |
| 44703.208333333336 | 30.25 |
| 44703.21875 | 30.27 |
| 44703.229166666664 | 30.29 |
| 44703.239583333336 | 30.32 |
| 44703.25 | 30.35 |
| 44703.260416666664 | 30.36 |
| 44703.270833333336 | 30.36 |
| 44703.28125 | 30.37 |
| 44703.291666666664 | 30.35 |
| 44703.302083333336 | 30.31 |
| 44703.3125 | 30.31 |
| 44703.322916666664 | 30.31 |
| 44703.333333333336 | 30.3 |
| 44703.34375 | 30.27 |
| 44703.354166666664 | 30.27 |
| 44703.364583333336 | 30.26 |
| 44703.375 | 30.23 |
| 44703.385416666664 | 30.17 |
| 44703.395833333336 | 30.2 |
| 44703.40625 | 30.15 |
| 44703.416666666664 | 30.12 |
| 44703.427083333336 | 30.06 |
| 44703.4375 | 29.98 |
| 44703.447916666664 | 29.81 |
| 44703.458333333336 | 29.65 |
| 44703.46875 | 29.42 |
| 44703.479166666664 | 29.25 |
| 44703.489583333336 | 29.09 |
| 44703.5 | 28.99 |
| 44703.510416666664 | 28.9 |
| 44703.520833333336 | 28.79 |
| 44703.53125 | 28.74 |
| 44703.541666666664 | 28.73 |
| 44703.552083333336 | 28.8 |
| 44703.5625 | 28.89 |
| 44703.572916666664 | 28.9 |
| 44703.583333333336 | 28.98 |
| 44703.59375 | 29.1 |
| 44703.604166666664 | 29.31 |
| 44703.614583333336 | 29.52 |
| 44703.625 | 29.69 |
| 44703.635416666664 | 29.8 |
| 44703.645833333336 | 29.87 |
| 44703.65625 | 29.95 |
| 44703.666666666664 | 30.08 |
| 44703.677083333336 | 30.17 |
| 44703.6875 | 30.24 |
| 44703.697916666664 | 30.31 |
| 44703.708333333336 | 30.33 |
| 44703.71875 | 30.32 |
| 44703.729166666664 | 30.34 |
| 44703.739583333336 | 30.35 |
| 44703.75 | 30.37 |
| 44703.760416666664 | 30.39 |
| 44703.770833333336 | 30.39 |
| 44703.78125 | 30.41 |
| 44703.791666666664 | 30.46 |
| 44703.802083333336 | 30.44 |
| 44703.8125 | 30.24 |
| 44703.822916666664 | 30.33 |
| 44703.833333333336 | 30.32 |
| 44703.84375 | 30.4 |
| 44703.854166666664 | 30.34 |
| 44703.864583333336 | 30.42 |
| 44703.875 | 30.42 |
| 44703.885416666664 | 30.42 |
| 44703.895833333336 | 30.46 |
| 44703.90625 | 30.39 |
| 44703.916666666664 | 30.41 |
| 44703.927083333336 | 30.32 |
| 44703.9375 | 30.13 |
| 44703.947916666664 | 29.93 |
| 44703.958333333336 | 29.71 |
| 44703.96875 | 29.48 |
| 44703.979166666664 | 29.46 |
| 44703.989583333336 | 29.33 |
| 44704.0 | 29.13 |
| 44704.010416666664 | 29.09 |
| 44704.020833333336 | 29.01 |
| 44704.03125 | 28.93 |
| 44704.041666666664 | 28.87 |
| 44704.052083333336 | 28.82 |
| 44704.0625 | 28.85 |
| 44704.072916666664 | 28.98 |
| 44704.083333333336 | 28.97 |
| 44704.09375 | 29 |
| 44704.104166666664 | 29.12 |
| 44704.114583333336 | 29.27 |
| 44704.125 | 29.48 |
| 44704.135416666664 | 29.77 |
| 44704.145833333336 | 29.93 |
| 44704.15625 | 30.04 |
| 44704.166666666664 | 30.16 |
| 44704.177083333336 | 30.25 |
| 44704.1875 | 30.31 |
| 44704.197916666664 | 30.36 |
| 44704.208333333336 | 30.4 |
| 44704.21875 | 30.43 |
| 44704.229166666664 | 30.45 |
| 44704.239583333336 | 30.47 |
| 44704.25 | 30.49 |
| 44704.260416666664 | 30.51 |
| 44704.270833333336 | 30.53 |
| 44704.28125 | 30.54 |
| 44704.291666666664 | 30.56 |
| 44704.302083333336 | 30.57 |
| 44704.3125 | 30.58 |
| 44704.322916666664 | 30.59 |
| 44704.333333333336 | 30.56 |
| 44704.34375 | 30.55 |
| 44704.354166666664 | 30.59 |
| 44704.364583333336 | 30.58 |
| 44704.375 | 30.56 |
| 44704.385416666664 | 30.54 |
| 44704.395833333336 | 30.51 |
| 44704.40625 | 30.46 |
| 44704.416666666664 | 30.43 |
| 44704.427083333336 | 30.4 |
| 44704.4375 | 30.36 |
| 44704.447916666664 | 30.3 |
| 44704.458333333336 | 30.19 |
| 44704.46875 | 30.17 |
| 44704.479166666664 | 30.04 |
| 44704.489583333336 | 30 |
| 44704.5 | 29.86 |
| 44704.510416666664 | 29.67 |
| 44704.520833333336 | 29.53 |
| 44704.53125 | 29.34 |
| 44704.541666666664 | 29.17 |
| 44704.552083333336 | 29.04 |
| 44704.5625 | 28.93 |
| 44704.572916666664 | 28.86 |
| 44704.583333333336 | 28.89 |
| 44704.59375 | 28.93 |
| 44704.604166666664 | 29.01 |
| 44704.614583333336 | 29.08 |
| 44704.625 | 29.13 |
| 44704.635416666664 | 29.25 |
| 44704.645833333336 | 29.39 |
| 44704.65625 | 29.62 |
| 44704.666666666664 | 29.86 |
| 44704.677083333336 | 30.03 |
| 44704.6875 | 30.04 |
| 44704.697916666664 | 30.08 |
| 44704.708333333336 | 30.16 |
| 44704.71875 | 30.26 |
| 44704.729166666664 | 30.33 |
| 44704.739583333336 | 30.39 |
| 44704.75 | 30.44 |
| 44704.760416666664 | 30.49 |
| 44704.770833333336 | 30.53 |
| 44704.78125 | 30.55 |
| 44704.791666666664 | 30.57 |
| 44704.802083333336 | 30.59 |
| 44704.8125 | 30.61 |
| 44704.822916666664 | 30.63 |
| 44704.833333333336 | 30.58 |
| 44704.84375 | 30.68 |
| 44704.854166666664 | 30.62 |
| 44704.864583333336 | 30.61 |
| 44704.875 | 30.56 |
| 44704.885416666664 | 30.62 |
| 44704.895833333336 | 30.61 |
| 44704.90625 | 30.59 |
| 44704.916666666664 | 30.58 |
| 44704.927083333336 | 30.54 |
| 44704.9375 | 30.52 |
| 44704.947916666664 | 30.47 |
| 44704.958333333336 | 30.44 |
| 44704.96875 | 30.36 |
| 44704.979166666664 | 30.28 |
| 44704.989583333336 | 30.18 |
| 44705.0 | 30.12 |
| 44705.010416666664 | 30.07 |
| 44705.020833333336 | 29.98 |
| 44705.03125 | 29.92 |
| 44705.041666666664 | 29.88 |
| 44705.052083333336 | 29.84 |
| 44705.0625 | 29.79 |
| 44705.072916666664 | 29.72 |
| 44705.083333333336 | 29.62 |
| 44705.09375 | 29.54 |
| 44705.104166666664 | 29.48 |
| 44705.114583333336 | 29.48 |
| 44705.125 | 29.57 |
| 44705.135416666664 | 29.63 |
| 44705.145833333336 | 29.63 |
| 44705.15625 | 29.7 |
| 44705.166666666664 | 29.79 |
| 44705.177083333336 | 29.84 |
| 44705.1875 | 29.97 |
| 44705.197916666664 | 30.1 |
| 44705.208333333336 | 30.23 |
| 44705.21875 | 30.31 |
| 44705.229166666664 | 30.38 |
| 44705.239583333336 | 30.44 |
| 44705.25 | 30.49 |
| 44705.260416666664 | 30.52 |
| 44705.270833333336 | 30.56 |
| 44705.28125 | 30.58 |
| 44705.291666666664 | 30.62 |
| 44705.302083333336 | 30.64 |
| 44705.3125 | 30.67 |
| 44705.322916666664 | 30.68 |
| 44705.333333333336 | 30.69 |
| 44705.34375 | 30.69 |
| 44705.354166666664 | 30.65 |
| 44705.364583333336 | 30.66 |
| 44705.375 | 30.65 |
| 44705.385416666664 | 30.68 |
| 44705.395833333336 | 30.66 |
| 44705.40625 | 30.6 |
| 44705.416666666664 | 30.54 |
| 44705.427083333336 | 30.43 |
| 44705.4375 | 30.42 |
| 44705.447916666664 | 30.45 |
| 44705.458333333336 | 30.51 |
| 44705.46875 | 30.39 |
| 44705.479166666664 | 30.4 |
| 44705.489583333336 | 30.32 |
| 44705.5 | 30.24 |
| 44705.510416666664 | 30.18 |
| 44705.520833333336 | 30.17 |
| 44705.53125 | 30.11 |
| 44705.541666666664 | 30.06 |
| 44705.552083333336 | 30 |
| 44705.5625 | 29.88 |
| 44705.572916666664 | 29.78 |
| 44705.583333333336 | 29.74 |
| 44705.59375 | 29.62 |
| 44705.604166666664 | 29.49 |
| 44705.614583333336 | 29.41 |
| 44705.625 | 29.34 |
| 44705.635416666664 | 29.33 |
| 44705.645833333336 | 29.48 |
| 44705.65625 | 29.46 |
| 44705.666666666664 | 29.45 |
| 44705.677083333336 | 29.55 |
| 44705.6875 | 29.64 |
| 44705.697916666664 | 29.7 |
| 44705.708333333336 | 29.76 |
| 44705.71875 | 29.85 |
| 44705.729166666664 | 30.01 |
| 44705.739583333336 | 30.11 |
| 44705.75 | 30.18 |
| 44705.760416666664 | 30.28 |
| 44705.770833333336 | 30.33 |
| 44705.78125 | 30.38 |
| 44705.791666666664 | 30.42 |
| 44705.802083333336 | 30.44 |
| 44705.8125 | 30.47 |
| 44705.822916666664 | 30.48 |
| 44705.833333333336 | 30.49 |
| 44705.84375 | 30.52 |
| 44705.854166666664 | 30.52 |
| 44705.864583333336 | 30.5 |
| 44705.875 | 30.33 |
| 44705.885416666664 | 30.08 |
| 44705.895833333336 | 30.15 |
| 44705.90625 | 29.99 |
| 44705.916666666664 | 29.97 |
| 44705.927083333336 | 30.03 |
| 44705.9375 | 30.01 |
| 44705.947916666664 | 29.87 |
| 44705.958333333336 | 30.1 |
| 44705.96875 | 29.95 |
| 44705.979166666664 | 29.84 |
| 44705.989583333336 | 29.73 |
| 44706.0 | 29.72 |
| 44706.010416666664 | 29.72 |
| 44706.020833333336 | 29.66 |
| 44706.03125 | 29.67 |
| 44706.041666666664 | 29.66 |
| 44706.052083333336 | 29.6 |
| 44706.0625 | 29.64 |
| 44706.072916666664 | 29.57 |
| 44706.083333333336 | 29.57 |
| 44706.09375 | 29.49 |
| 44706.104166666664 | 29.34 |
| 44706.114583333336 | 29.26 |
| 44706.125 | 29.15 |
| 44706.135416666664 | 29.11 |
| 44706.145833333336 | 29.07 |
| 44706.15625 | 29.03 |
| 44706.166666666664 | 29.01 |
| 44706.177083333336 | 29 |
| 44706.1875 | 29.07 |
| 44706.197916666664 | 29.06 |
| 44706.208333333336 | 29.07 |
| 44706.21875 | 29.11 |
| 44706.229166666664 | 29.18 |
| 44706.239583333336 | 29.22 |
| 44706.25 | 29.35 |
| 44706.260416666664 | 29.58 |
| 44706.270833333336 | 29.73 |
| 44706.28125 | 29.82 |
| 44706.291666666664 | 29.92 |
| 44706.302083333336 | 29.97 |
| 44706.3125 | 30.06 |
| 44706.322916666664 | 30.13 |
| 44706.333333333336 | 30.16 |
| 44706.34375 | 30.18 |
| 44706.354166666664 | 30.21 |
| 44706.364583333336 | 30.27 |
| 44706.375 | 30.31 |
| 44706.385416666664 | 30.34 |
| 44706.395833333336 | 30.25 |
| 44706.40625 | 30.36 |
| 44706.416666666664 | 30.38 |
| 44706.427083333336 | 30.25 |
| 44706.4375 | 30.23 |
| 44706.447916666664 | 30.24 |
| 44706.458333333336 | 30.23 |
| 44706.46875 | 30.22 |
| 44706.479166666664 | 30.19 |
| 44706.489583333336 | 30.08 |
| 44706.5 | 29.99 |
| 44706.510416666664 | 29.83 |
| 44706.520833333336 | 29.82 |
| 44706.53125 | 29.72 |
| 44706.541666666664 | 29.67 |
| 44706.552083333336 | 29.59 |
| 44706.5625 | 29.52 |
| 44706.572916666664 | 29.43 |
| 44706.583333333336 | 29.38 |
| 44706.59375 | 29.34 |
| 44706.604166666664 | 29.28 |
| 44706.614583333336 | 29.19 |
| 44706.625 | 29.16 |
| 44706.635416666664 | 29.1 |
| 44706.645833333336 | 29.03 |
| 44706.65625 | 28.98 |
| 44706.666666666664 | 28.95 |
| 44706.677083333336 | 28.97 |
| 44706.6875 | 28.93 |
| 44706.697916666664 | 28.9 |
| 44706.708333333336 | 28.98 |
| 44706.71875 | 28.94 |
| 44706.729166666664 | 28.91 |
| 44706.739583333336 | 28.87 |
| 44706.75 | 28.96 |
| 44706.760416666664 | 29.12 |
| 44706.770833333336 | 29.26 |
| 44706.78125 | 29.42 |
| 44706.791666666664 | 29.62 |
| 44706.802083333336 | 29.69 |
| 44706.8125 | 29.77 |
| 44706.822916666664 | 29.79 |
| 44706.833333333336 | 29.95 |
| 44706.84375 | 30.12 |
| 44706.854166666664 | 30.23 |
| 44706.864583333336 | 30.31 |
| 44706.875 | 30.33 |
| 44706.885416666664 | 30.41 |
| 44706.895833333336 | 30.37 |
| 44706.90625 | 30.16 |
| 44706.916666666664 | 30.43 |
| 44706.927083333336 | 30.41 |
| 44706.9375 | 30.1 |
| 44706.947916666664 | 30.2 |
| 44706.958333333336 | 30.25 |
| 44706.96875 | 30.2 |
| 44706.979166666664 | 30.22 |
| 44706.989583333336 | 30.14 |
| 44707.0 | 30.11 |
| 44707.010416666664 | 29.99 |
| 44707.020833333336 | 29.91 |
| 44707.03125 | 29.79 |
| 44707.041666666664 | 29.83 |
| 44707.052083333336 | 29.76 |
| 44707.0625 | 29.71 |
| 44707.072916666664 | 29.63 |
| 44707.083333333336 | 29.63 |
| 44707.09375 | 29.56 |
| 44707.104166666664 | 29.54 |
| 44707.114583333336 | 29.55 |
| 44707.125 | 29.55 |
| 44707.135416666664 | 29.56 |
| 44707.145833333336 | 29.51 |
| 44707.15625 | 29.44 |
| 44707.166666666664 | 29.33 |
| 44707.177083333336 | 29.24 |
| 44707.1875 | 29.15 |
| 44707.197916666664 | 29.11 |
| 44707.208333333336 | 29.15 |
| 44707.21875 | 29.27 |
| 44707.229166666664 | 29.27 |
| 44707.239583333336 | 29.28 |
| 44707.25 | 29.35 |
| 44707.260416666664 | 29.47 |
| 44707.270833333336 | 29.52 |
| 44707.28125 | 29.6 |
| 44707.291666666664 | 29.76 |
| 44707.302083333336 | 29.84 |
| 44707.3125 | 29.9 |
| 44707.322916666664 | 29.99 |
| 44707.333333333336 | 30.08 |
| 44707.34375 | 30.21 |
| 44707.354166666664 | 30.24 |
| 44707.364583333336 | 30.27 |
| 44707.375 | 30.31 |
| 44707.385416666664 | 30.34 |
| 44707.395833333336 | 30.38 |
| 44707.40625 | 30.42 |
| 44707.416666666664 | 30.45 |
| 44707.427083333336 | 30.44 |
| 44707.4375 | 30.46 |
| 44707.447916666664 | 30.56 |
| 44707.458333333336 | 30.4 |
| 44707.46875 | 30.39 |
| 44707.479166666664 | 30.38 |
| 44707.489583333336 | 30.39 |
| 44707.5 | 30.4 |
| 44707.510416666664 | 30.34 |
| 44707.520833333336 | 30.31 |
| 44707.53125 | 30.24 |
| 44707.541666666664 | 30.19 |
| 44707.552083333336 | 30.13 |
| 44707.5625 | 30.08 |
| 44707.572916666664 | 29.98 |
| 44707.583333333336 | 29.9 |
| 44707.59375 | 29.86 |
| 44707.604166666664 | 29.78 |
| 44707.614583333336 | 29.72 |
| 44707.625 | 29.61 |
| 44707.635416666664 | 29.57 |
| 44707.645833333336 | 29.45 |
| 44707.65625 | 29.38 |
| 44707.666666666664 | 29.24 |
| 44707.677083333336 | 29.04 |
| 44707.6875 | 28.92 |
| 44707.697916666664 | 28.78 |
| 44707.708333333336 | 28.73 |
| 44707.71875 | 28.92 |
| 44707.729166666664 | 29.04 |
| 44707.739583333336 | 29.02 |
| 44707.75 | 29.1 |
| 44707.760416666664 | 29.21 |
| 44707.770833333336 | 29.36 |
| 44707.78125 | 29.55 |
| 44707.791666666664 | 29.73 |
| 44707.802083333336 | 29.83 |
| 44707.8125 | 29.93 |
| 44707.822916666664 | 30.05 |
| 44707.833333333336 | 30.16 |
| 44707.84375 | 30.24 |
| 44707.854166666664 | 30.3 |
| 44707.864583333336 | 30.34 |
| 44707.875 | 30.4 |
| 44707.885416666664 | 30.43 |
| 44707.895833333336 | 30.44 |
| 44707.90625 | 30.51 |
| 44707.916666666664 | 30.54 |
| 44707.927083333336 | 30.58 |
| 44707.9375 | 30.62 |
| 44707.947916666664 | 30.63 |
| 44707.958333333336 | 30.63 |
| 44707.96875 | 30.64 |
| 44707.979166666664 | 30.64 |
| 44707.989583333336 | 30.56 |
| 44708.0 | 30.38 |
| 44708.010416666664 | 30.46 |
| 44708.020833333336 | 30.52 |
| 44708.03125 | 30.51 |
| 44708.041666666664 | 30.52 |
| 44708.052083333336 | 30.5 |
| 44708.0625 | 30.42 |
| 44708.072916666664 | 30.4 |
| 44708.083333333336 | 30.34 |
| 44708.09375 | 30.25 |
| 44708.104166666664 | 30.12 |
| 44708.114583333336 | 30.06 |
| 44708.125 | 29.95 |
| 44708.135416666664 | 29.88 |
| 44708.145833333336 | 29.75 |
| 44708.15625 | 29.57 |
| 44708.166666666664 | 29.41 |
| 44708.177083333336 | 29.21 |
| 44708.1875 | 29.08 |
| 44708.197916666664 | 28.97 |
| 44708.208333333336 | 28.87 |
| 44708.21875 | 28.83 |
| 44708.229166666664 | 28.84 |
| 44708.239583333336 | 28.92 |
| 44708.25 | 28.98 |
| 44708.260416666664 | 29.02 |
| 44708.270833333336 | 29.08 |
| 44708.28125 | 29.18 |
| 44708.291666666664 | 29.32 |
| 44708.302083333336 | 29.55 |
| 44708.3125 | 29.76 |
| 44708.322916666664 | 29.91 |
| 44708.333333333336 | 30 |
| 44708.34375 | 30.03 |
| 44708.354166666664 | 30.12 |
| 44708.364583333336 | 30.16 |
| 44708.375 | 30.2 |
| 44708.385416666664 | 30.27 |
| 44708.395833333336 | 30.31 |
| 44708.40625 | 30.36 |
| 44708.416666666664 | 30.39 |
| 44708.427083333336 | 30.42 |
| 44708.4375 | 30.45 |
| 44708.447916666664 | 30.5 |
| 44708.458333333336 | 30.5 |
| 44708.46875 | 30.52 |
| 44708.479166666664 | 30.54 |
| 44708.489583333336 | 30.55 |
| 44708.5 | 30.46 |
| 44708.510416666664 | 30.47 |
| 44708.520833333336 | 30.44 |
| 44708.53125 | 30.38 |
| 44708.541666666664 | 30.38 |
| 44708.552083333336 | 30.31 |
| 44708.5625 | 30.36 |
| 44708.572916666664 | 30.31 |
| 44708.583333333336 | 30.17 |
| 44708.59375 | 30.13 |
| 44708.604166666664 | 30.13 |
| 44708.614583333336 | 30.07 |
| 44708.625 | 30.02 |
| 44708.635416666664 | 29.89 |
| 44708.645833333336 | 29.75 |
| 44708.65625 | 29.65 |
| 44708.666666666664 | 29.55 |
| 44708.677083333336 | 29.42 |
| 44708.6875 | 29.34 |
| 44708.697916666664 | 29.3 |
| 44708.708333333336 | 29.23 |
| 44708.71875 | 29.21 |
| 44708.729166666664 | 29.27 |
| 44708.739583333336 | 29.31 |
| 44708.75 | 29.28 |
| 44708.760416666664 | 29.29 |
| 44708.770833333336 | 29.5 |
| 44708.78125 | 29.68 |
| 44708.791666666664 | 29.79 |
| 44708.802083333336 | 29.96 |
| 44708.8125 | 30.02 |
| 44708.822916666664 | 30.05 |
| 44708.833333333336 | 30.07 |
| 44708.84375 | 30.13 |
| 44708.854166666664 | 30.14 |
| 44708.864583333336 | 30.17 |
| 44708.875 | 30.17 |
| 44708.885416666664 | 30.18 |
| 44708.895833333336 | 30.18 |
| 44708.90625 | 30.17 |
| 44708.916666666664 | 30.19 |
| 44708.927083333336 | 30.2 |
| 44708.9375 | 30.26 |
| 44708.947916666664 | 30.33 |
| 44708.958333333336 | 30.37 |
| 44708.96875 | 30.39 |
| 44708.979166666664 | 30.43 |
| 44708.989583333336 | 30.43 |
| 44709.0 | 30.45 |
| 44709.010416666664 | 30.47 |
| 44709.020833333336 | 30.36 |
| 44709.03125 | 30.27 |
| 44709.041666666664 | 30.34 |
| 44709.052083333336 | 30.29 |
| 44709.0625 | 30.28 |
| 44709.072916666664 | 30.23 |
| 44709.083333333336 | 30.17 |
| 44709.09375 | 30.11 |
| 44709.104166666664 | 30.11 |
| 44709.114583333336 | 30.05 |
| 44709.125 | 30.06 |
| 44709.135416666664 | 30.01 |
| 44709.145833333336 | 29.89 |
| 44709.15625 | 29.85 |
| 44709.166666666664 | 29.71 |
| 44709.177083333336 | 29.63 |
| 44709.1875 | 29.45 |
| 44709.197916666664 | 29.25 |
| 44709.208333333336 | 28.98 |
| 44709.21875 | 28.78 |
| 44709.229166666664 | 28.55 |
| 44709.239583333336 | 28.38 |
| 44709.25 | 28.17 |
| 44709.260416666664 | 28.04 |
| 44709.270833333336 | 28.01 |
| 44709.28125 | 28.1 |
| 44709.291666666664 | 28.27 |
| 44709.302083333336 | 28.34 |
| 44709.3125 | 28.49 |
| 44709.322916666664 | 28.7 |
| 44709.333333333336 | 28.94 |
| 44709.34375 | 29.24 |
| 44709.354166666664 | 29.48 |
| 44709.364583333336 | 29.61 |
| 44709.375 | 29.68 |
| 44709.385416666664 | 29.79 |
| 44709.395833333336 | 29.86 |
| 44709.40625 | 29.9 |
| 44709.416666666664 | 29.98 |
| 44709.427083333336 | 30.01 |
| 44709.4375 | 30.08 |
| 44709.447916666664 | 30.11 |
| 44709.458333333336 | 30.14 |
| 44709.46875 | 30.2 |
| 44709.479166666664 | 30.26 |
| 44709.489583333336 | 30.32 |
| 44709.5 | 30.37 |
| 44709.510416666664 | 30.39 |
| 44709.520833333336 | 30.45 |
| 44709.53125 | 30.36 |
| 44709.541666666664 | 30.36 |
| 44709.552083333336 | 30.31 |
| 44709.5625 | 30.27 |
| 44709.572916666664 | 30.2 |
| 44709.583333333336 | 30.16 |
| 44709.59375 | 30.17 |
| 44709.604166666664 | 30.09 |
| 44709.614583333336 | 30.05 |
| 44709.625 | 29.98 |
| 44709.635416666664 | 29.83 |
| 44709.645833333336 | 29.73 |
| 44709.65625 | 29.45 |
| 44709.666666666664 | 29.21 |
| 44709.677083333336 | 28.83 |
| 44709.6875 | 28.45 |
| 44709.697916666664 | 28.15 |
| 44709.708333333336 | 27.87 |
| 44709.71875 | 27.59 |
| 44709.729166666664 | 27.26 |
| 44709.739583333336 | 27.06 |
| 44709.75 | 27 |
| 44709.760416666664 | 27.02 |
| 44709.770833333336 | 27.17 |
| 44709.78125 | 27.59 |
| 44709.791666666664 | 27.65 |
| 44709.802083333336 | 28.02 |
| 44709.8125 | 28.52 |
| 44709.822916666664 | 29.15 |
| 44709.833333333336 | 29.49 |
| 44709.84375 | 29.62 |
| 44709.854166666664 | 29.77 |
| 44709.864583333336 | 29.88 |
| 44709.875 | 30.03 |
| 44709.885416666664 | 30.13 |
| 44709.895833333336 | 30.18 |
| 44709.90625 | 30.23 |
| 44709.916666666664 | 30.27 |
| 44709.927083333336 | 30.35 |
| 44709.9375 | 30.43 |
| 44709.947916666664 | 30.49 |
| 44709.958333333336 | 30.52 |
| 44709.96875 | 30.55 |
| 44709.979166666664 | 30.56 |
| 44709.989583333336 | 30.58 |
| 44710.0 | 30.57 |
| 44710.010416666664 | 30.57 |
| 44710.020833333336 | 30.57 |
| 44710.03125 | 30.57 |
| 44710.041666666664 | 30.56 |
| 44710.052083333336 | 30.51 |
| 44710.0625 | 30.52 |
| 44710.072916666664 | 30.53 |
| 44710.083333333336 | 30.49 |
| 44710.09375 | 30.5 |
| 44710.104166666664 | 30.48 |
| 44710.114583333336 | 30.49 |
| 44710.125 | 30.43 |
| 44710.135416666664 | 30.39 |
| 44710.145833333336 | 30.34 |
| 44710.15625 | 30.22 |
| 44710.166666666664 | 30.11 |
| 44710.177083333336 | 29.95 |
| 44710.1875 | 29.69 |
| 44710.197916666664 | 29.48 |
| 44710.208333333336 | 29.15 |
| 44710.21875 | 28.95 |
| 44710.229166666664 | 28.72 |
| 44710.239583333336 | 28.57 |
| 44710.25 | 28.45 |
| 44710.260416666664 | 28.31 |
| 44710.270833333336 | 28.23 |
| 44710.28125 | 28.19 |
| 44710.291666666664 | 28.17 |
| 44710.302083333336 | 28.19 |
| 44710.3125 | 28.31 |
| 44710.322916666664 | 28.35 |
| 44710.333333333336 | 28.39 |
| 44710.34375 | 28.5 |
| 44710.354166666664 | 28.7 |
| 44710.364583333336 | 29.18 |
| 44710.375 | 29.52 |
| 44710.385416666664 | 29.75 |
| 44710.395833333336 | 29.79 |
| 44710.40625 | 29.92 |
| 44710.416666666664 | 29.99 |
| 44710.427083333336 | 30.06 |
| 44710.4375 | 30.09 |
| 44710.447916666664 | 30.15 |
| 44710.458333333336 | 30.21 |
| 44710.46875 | 30.29 |
| 44710.479166666664 | 30.37 |
| 44710.489583333336 | 30.43 |
| 44710.5 | 30.47 |
| 44710.510416666664 | 30.5 |
| 44710.520833333336 | 30.51 |
| 44710.53125 | 30.53 |
| 44710.541666666664 | 30.55 |
| 44710.552083333336 | 30.54 |
| 44710.5625 | 30.49 |
| 44710.572916666664 | 30.49 |
| 44710.583333333336 | 30.42 |
| 44710.59375 | 30.38 |
| 44710.604166666664 | 30.31 |
| 44710.614583333336 | 30.2 |
| 44710.625 | 30.08 |
| 44710.635416666664 | 30.05 |
| 44710.645833333336 | 30.01 |
| 44710.65625 | 29.98 |
| 44710.666666666664 | 29.76 |
| 44710.677083333336 | 29.51 |
| 44710.6875 | 29.34 |
| 44710.697916666664 | 29.09 |
| 44710.708333333336 | 28.81 |
| 44710.71875 | 28.57 |
| 44710.729166666664 | 28.34 |
| 44710.739583333336 | 28.27 |
| 44710.75 | 28.14 |
| 44710.760416666664 | 28.1 |
| 44710.770833333336 | 28.07 |
| 44710.78125 | 28.07 |
| 44710.791666666664 | 28.1 |
| 44710.802083333336 | 28.19 |
| 44710.8125 | 28.2 |
| 44710.822916666664 | 28.35 |
| 44710.833333333336 | 28.6 |
| 44710.84375 | 28.93 |
| 44710.854166666664 | 29.31 |
| 44710.864583333336 | 29.55 |
| 44710.875 | 29.77 |
| 44710.885416666664 | 29.88 |
| 44710.895833333336 | 30.02 |
| 44710.90625 | 30.13 |
| 44710.916666666664 | 30.23 |
| 44710.927083333336 | 30.36 |
| 44710.9375 | 30.41 |
| 44710.947916666664 | 30.46 |
| 44710.958333333336 | 30.51 |
| 44710.96875 | 30.55 |
| 44710.979166666664 | 30.58 |
| 44710.989583333336 | 30.6 |
| 44711.0 | 30.61 |
| 44711.010416666664 | 30.63 |
| 44711.020833333336 | 30.65 |
| 44711.03125 | 30.65 |
| 44711.041666666664 | 30.65 |
| 44711.052083333336 | 30.65 |
| 44711.0625 | 30.66 |
| 44711.072916666664 | 30.65 |
| 44711.083333333336 | 30.61 |
| 44711.09375 | 30.6 |
| 44711.104166666664 | 30.56 |
| 44711.114583333336 | 30.6 |
| 44711.125 | 30.56 |
| 44711.135416666664 | 30.57 |
| 44711.145833333336 | 30.56 |
| 44711.15625 | 30.54 |
| 44711.166666666664 | 30.52 |
| 44711.177083333336 | 30.44 |
| 44711.1875 | 30.39 |
| 44711.197916666664 | 30.33 |
| 44711.208333333336 | 30.23 |
| 44711.21875 | 30.07 |
| 44711.229166666664 | 29.91 |
| 44711.239583333336 | 29.68 |
| 44711.25 | 29.5 |
| 44711.260416666664 | 29.36 |
| 44711.270833333336 | 29.24 |
| 44711.28125 | 29.13 |
| 44711.291666666664 | 29.03 |
| 44711.302083333336 | 28.93 |
| 44711.3125 | 28.87 |
| 44711.322916666664 | 28.85 |
| 44711.333333333336 | 28.95 |
| 44711.34375 | 29.04 |
| 44711.354166666664 | 29.05 |
| 44711.364583333336 | 29.1 |
| 44711.375 | 29.23 |
| 44711.385416666664 | 29.4 |
| 44711.395833333336 | 29.74 |
| 44711.40625 | 29.95 |
| 44711.416666666664 | 30.03 |
| 44711.427083333336 | 30.1 |
| 44711.4375 | 30.15 |
| 44711.447916666664 | 30.19 |
| 44711.458333333336 | 30.25 |
| 44711.46875 | 30.29 |
| 44711.479166666664 | 30.35 |
| 44711.489583333336 | 30.41 |
| 44711.5 | 30.45 |
| 44711.510416666664 | 30.49 |
| 44711.520833333336 | 30.52 |
| 44711.53125 | 30.56 |
| 44711.541666666664 | 30.58 |
| 44711.552083333336 | 30.6 |
| 44711.5625 | 30.61 |
| 44711.572916666664 | 30.59 |
| 44711.583333333336 | 30.59 |
| 44711.59375 | 30.45 |
| 44711.604166666664 | 30.54 |
| 44711.614583333336 | 30.5 |
| 44711.625 | 30.5 |
| 44711.635416666664 | 30.33 |
| 44711.645833333336 | 30.35 |
| 44711.65625 | 30.24 |
| 44711.666666666664 | 30.29 |
| 44711.677083333336 | 30.26 |
| 44711.6875 | 30.24 |
| 44711.697916666664 | 30.15 |
| 44711.708333333336 | 30.02 |
| 44711.71875 | 29.83 |
| 44711.729166666664 | 29.7 |
| 44711.739583333336 | 29.55 |
| 44711.75 | 29.51 |
| 44711.760416666664 | 29.39 |
| 44711.770833333336 | 29.29 |
| 44711.78125 | 29.32 |
| 44711.791666666664 | 29.24 |
| 44711.802083333336 | 29.18 |
| 44711.8125 | 29.15 |
| 44711.822916666664 | 29.28 |
| 44711.833333333336 | 29.31 |
| 44711.84375 | 29.35 |
| 44711.854166666664 | 29.5 |
| 44711.864583333336 | 29.66 |
| 44711.875 | 29.91 |
| 44711.885416666664 | 30.14 |
| 44711.895833333336 | 30.3 |
| 44711.90625 | 30.39 |
| 44711.916666666664 | 30.5 |
| 44711.927083333336 | 30.54 |
| 44711.9375 | 30.6 |
| 44711.947916666664 | 30.67 |
| 44711.958333333336 | 30.69 |
| 44711.96875 | 30.72 |
| 44711.979166666664 | 30.76 |
| 44711.989583333336 | 30.77 |
| 44712.0 | 30.79 |
| 44712.010416666664 | 30.81 |
| 44712.020833333336 | 30.83 |
| 44712.03125 | 30.84 |
| 44712.041666666664 | 30.85 |
| 44712.052083333336 | 30.85 |
| 44712.0625 | 30.86 |
| 44712.072916666664 | 30.86 |
| 44712.083333333336 | 30.87 |
| 44712.09375 | 30.85 |
| 44712.104166666664 | 30.83 |
| 44712.114583333336 | 30.82 |
| 44712.125 | 30.8 |
| 44712.135416666664 | 30.81 |
| 44712.145833333336 | 30.8 |
| 44712.15625 | 30.78 |
| 44712.166666666664 | 30.78 |
| 44712.177083333336 | 30.76 |
| 44712.1875 | 30.73 |
| 44712.197916666664 | 30.75 |
| 44712.208333333336 | 30.7 |
| 44712.21875 | 30.64 |
| 44712.229166666664 | 30.49 |
| 44712.239583333336 | 30.38 |
| 44712.25 | 30.18 |
| 44712.260416666664 | 29.95 |
| 44712.270833333336 | 29.78 |
| 44712.28125 | 29.68 |
| 44712.291666666664 | 29.55 |
| 44712.302083333336 | 29.43 |
| 44712.3125 | 29.26 |
| 44712.322916666664 | 29.19 |
| 44712.333333333336 | 29.1 |
| 44712.34375 | 29.04 |
| 44712.354166666664 | 29.05 |
| 44712.364583333336 | 29.21 |
| 44712.375 | 29.24 |
| 44712.385416666664 | 29.28 |
| 44712.395833333336 | 29.4 |
| 44712.40625 | 29.51 |
| 44712.416666666664 | 29.73 |
| 44712.427083333336 | 30.02 |
| 44712.4375 | 30.15 |
| 44712.447916666664 | 30.24 |
| 44712.458333333336 | 30.31 |
| 44712.46875 | 30.4 |
| 44712.479166666664 | 30.46 |
| 44712.489583333336 | 30.53 |
| 44712.5 | 30.58 |
| 44712.510416666664 | 30.63 |
| 44712.520833333336 | 30.67 |
| 44712.53125 | 30.71 |
| 44712.541666666664 | 30.74 |
| 44712.552083333336 | 30.76 |
| 44712.5625 | 30.79 |
| 44712.572916666664 | 30.8 |
| 44712.583333333336 | 30.81 |
| 44712.59375 | 30.8 |
| 44712.604166666664 | 30.81 |
| 44712.614583333336 | 30.81 |
| 44712.625 | 30.77 |
| 44712.635416666664 | 30.8 |
| 44712.645833333336 | 30.76 |
| 44712.65625 | 30.75 |
| 44712.666666666664 | 30.73 |
| 44712.677083333336 | 30.68 |
| 44712.6875 | 30.82 |
| 44712.697916666664 | 30.73 |
| 44712.708333333336 | 30.61 |
| 44712.71875 | 30.46 |
| 44712.729166666664 | 30.03 |
| 44712.739583333336 | 29.78 |
| 44712.75 | 29.58 |
| 44712.760416666664 | 29.37 |
| 44712.770833333336 | 29.19 |
| 44712.78125 | 29.01 |
| 44712.791666666664 | 28.92 |
| 44712.802083333336 | 28.87 |
| 44712.8125 | 28.83 |
| 44712.822916666664 | 28.86 |
| 44712.833333333336 | 28.85 |
| 44712.84375 | 28.83 |
| 44712.854166666664 | 28.97 |
| 44712.864583333336 | 29.08 |
| 44712.875 | 29.17 |
| 44712.885416666664 | 29.31 |
| 44712.895833333336 | 29.37 |
| 44712.90625 | 29.59 |
| 44712.916666666664 | 29.92 |
| 44712.927083333336 | 30.21 |
| 44712.9375 | 30.41 |
| 44712.947916666664 | 30.53 |
| 44712.958333333336 | 30.63 |
| 44712.96875 | 30.69 |
| 44712.979166666664 | 30.73 |
| 44712.989583333336 | 30.78 |
| 44713.0 | 30.81 |
| 44713.010416666664 | 30.85 |
| 44713.020833333336 | 30.88 |
| 44713.03125 | 30.89 |
| 44713.041666666664 | 30.92 |
| 44713.052083333336 | 30.94 |
| 44713.0625 | 30.94 |
| 44713.072916666664 | 30.95 |
| 44713.083333333336 | 30.96 |
| 44713.09375 | 30.97 |
| 44713.104166666664 | 30.97 |
| 44713.114583333336 | 30.97 |
| 44713.125 | 31 |
| 44713.135416666664 | 30.97 |
| 44713.145833333336 | 30.97 |
| 44713.15625 | 30.95 |